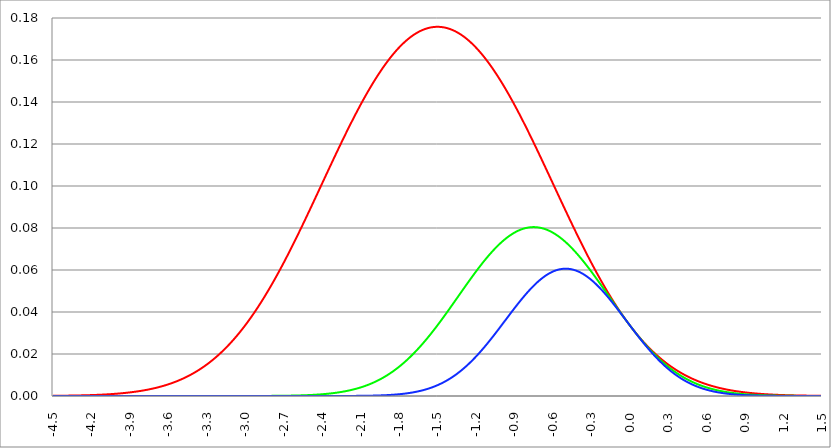
| Category | Series 1 | Series 0 | Series 2 |
|---|---|---|---|
| -4.5 | 0 | 0 | 0 |
| -4.497 | 0 | 0 | 0 |
| -4.494 | 0 | 0 | 0 |
| -4.491 | 0 | 0 | 0 |
| -4.488 | 0 | 0 | 0 |
| -4.484999999999999 | 0 | 0 | 0 |
| -4.482 | 0 | 0 | 0 |
| -4.479 | 0 | 0 | 0 |
| -4.476 | 0 | 0 | 0 |
| -4.472999999999999 | 0 | 0 | 0 |
| -4.469999999999999 | 0 | 0 | 0 |
| -4.466999999999999 | 0 | 0 | 0 |
| -4.463999999999999 | 0 | 0 | 0 |
| -4.460999999999998 | 0 | 0 | 0 |
| -4.457999999999998 | 0 | 0 | 0 |
| -4.454999999999998 | 0 | 0 | 0 |
| -4.451999999999998 | 0 | 0 | 0 |
| -4.448999999999998 | 0 | 0 | 0 |
| -4.445999999999998 | 0 | 0 | 0 |
| -4.442999999999998 | 0 | 0 | 0 |
| -4.439999999999997 | 0 | 0 | 0 |
| -4.436999999999997 | 0 | 0 | 0 |
| -4.433999999999997 | 0 | 0 | 0 |
| -4.430999999999997 | 0 | 0 | 0 |
| -4.427999999999997 | 0 | 0 | 0 |
| -4.424999999999997 | 0 | 0 | 0 |
| -4.421999999999997 | 0 | 0 | 0 |
| -4.418999999999997 | 0 | 0 | 0 |
| -4.415999999999997 | 0 | 0 | 0 |
| -4.412999999999997 | 0 | 0 | 0 |
| -4.409999999999996 | 0 | 0 | 0 |
| -4.406999999999996 | 0 | 0 | 0 |
| -4.403999999999996 | 0 | 0 | 0 |
| -4.400999999999996 | 0 | 0 | 0 |
| -4.397999999999996 | 0 | 0 | 0 |
| -4.394999999999996 | 0 | 0 | 0 |
| -4.391999999999996 | 0 | 0 | 0 |
| -4.388999999999996 | 0 | 0 | 0 |
| -4.385999999999996 | 0 | 0 | 0 |
| -4.382999999999996 | 0 | 0 | 0 |
| -4.379999999999995 | 0 | 0 | 0 |
| -4.376999999999995 | 0 | 0 | 0 |
| -4.373999999999995 | 0 | 0 | 0 |
| -4.370999999999995 | 0 | 0 | 0 |
| -4.367999999999995 | 0 | 0 | 0 |
| -4.364999999999995 | 0 | 0 | 0 |
| -4.361999999999995 | 0 | 0 | 0 |
| -4.358999999999995 | 0 | 0 | 0 |
| -4.355999999999994 | 0 | 0 | 0 |
| -4.352999999999994 | 0 | 0 | 0 |
| -4.349999999999994 | 0 | 0 | 0 |
| -4.346999999999994 | 0 | 0 | 0 |
| -4.343999999999994 | 0 | 0 | 0 |
| -4.340999999999994 | 0 | 0 | 0 |
| -4.337999999999994 | 0 | 0 | 0 |
| -4.334999999999994 | 0 | 0 | 0 |
| -4.331999999999994 | 0 | 0 | 0 |
| -4.328999999999993 | 0 | 0 | 0 |
| -4.325999999999993 | 0 | 0 | 0 |
| -4.322999999999993 | 0 | 0 | 0 |
| -4.319999999999993 | 0 | 0 | 0 |
| -4.316999999999993 | 0 | 0 | 0 |
| -4.313999999999993 | 0 | 0 | 0 |
| -4.310999999999993 | 0 | 0 | 0 |
| -4.307999999999993 | 0 | 0 | 0 |
| -4.304999999999993 | 0 | 0 | 0 |
| -4.301999999999992 | 0 | 0 | 0 |
| -4.298999999999992 | 0 | 0 | 0 |
| -4.295999999999992 | 0 | 0 | 0 |
| -4.292999999999992 | 0 | 0 | 0 |
| -4.289999999999992 | 0 | 0 | 0 |
| -4.286999999999992 | 0 | 0 | 0 |
| -4.283999999999992 | 0 | 0 | 0 |
| -4.280999999999992 | 0 | 0 | 0 |
| -4.277999999999992 | 0 | 0 | 0 |
| -4.274999999999991 | 0 | 0 | 0 |
| -4.271999999999991 | 0 | 0 | 0 |
| -4.268999999999991 | 0 | 0 | 0 |
| -4.265999999999991 | 0 | 0 | 0 |
| -4.262999999999991 | 0 | 0 | 0 |
| -4.259999999999991 | 0 | 0 | 0 |
| -4.256999999999991 | 0 | 0 | 0 |
| -4.253999999999991 | 0 | 0 | 0 |
| -4.250999999999991 | 0 | 0 | 0 |
| -4.24799999999999 | 0 | 0 | 0 |
| -4.24499999999999 | 0 | 0 | 0 |
| -4.24199999999999 | 0 | 0 | 0 |
| -4.23899999999999 | 0 | 0 | 0 |
| -4.23599999999999 | 0 | 0 | 0 |
| -4.23299999999999 | 0 | 0 | 0 |
| -4.22999999999999 | 0 | 0 | 0 |
| -4.22699999999999 | 0 | 0 | 0 |
| -4.22399999999999 | 0 | 0 | 0 |
| -4.220999999999989 | 0 | 0 | 0 |
| -4.217999999999989 | 0 | 0 | 0 |
| -4.214999999999989 | 0 | 0 | 0 |
| -4.21199999999999 | 0 | 0 | 0 |
| -4.208999999999989 | 0 | 0 | 0 |
| -4.205999999999989 | 0 | 0 | 0 |
| -4.202999999999989 | 0 | 0 | 0 |
| -4.199999999999989 | 0 | 0 | 0 |
| -4.196999999999988 | 0 | 0 | 0 |
| -4.193999999999988 | 0 | 0 | 0 |
| -4.190999999999988 | 0 | 0 | 0 |
| -4.187999999999988 | 0 | 0 | 0 |
| -4.184999999999988 | 0 | 0 | 0 |
| -4.181999999999988 | 0 | 0 | 0 |
| -4.178999999999988 | 0 | 0 | 0 |
| -4.175999999999988 | 0 | 0 | 0 |
| -4.172999999999988 | 0 | 0 | 0 |
| -4.169999999999987 | 0.001 | 0 | 0 |
| -4.166999999999987 | 0.001 | 0 | 0 |
| -4.163999999999987 | 0.001 | 0 | 0 |
| -4.160999999999987 | 0.001 | 0 | 0 |
| -4.157999999999987 | 0.001 | 0 | 0 |
| -4.154999999999987 | 0.001 | 0 | 0 |
| -4.151999999999987 | 0.001 | 0 | 0 |
| -4.148999999999987 | 0.001 | 0 | 0 |
| -4.145999999999987 | 0.001 | 0 | 0 |
| -4.142999999999986 | 0.001 | 0 | 0 |
| -4.139999999999986 | 0.001 | 0 | 0 |
| -4.136999999999986 | 0.001 | 0 | 0 |
| -4.133999999999986 | 0.001 | 0 | 0 |
| -4.130999999999986 | 0.001 | 0 | 0 |
| -4.127999999999986 | 0.001 | 0 | 0 |
| -4.124999999999986 | 0.001 | 0 | 0 |
| -4.121999999999986 | 0.001 | 0 | 0 |
| -4.118999999999986 | 0.001 | 0 | 0 |
| -4.115999999999985 | 0.001 | 0 | 0 |
| -4.112999999999985 | 0.001 | 0 | 0 |
| -4.109999999999985 | 0.001 | 0 | 0 |
| -4.106999999999985 | 0.001 | 0 | 0 |
| -4.103999999999985 | 0.001 | 0 | 0 |
| -4.100999999999985 | 0.001 | 0 | 0 |
| -4.097999999999985 | 0.001 | 0 | 0 |
| -4.094999999999985 | 0.001 | 0 | 0 |
| -4.091999999999984 | 0.001 | 0 | 0 |
| -4.088999999999984 | 0.001 | 0 | 0 |
| -4.085999999999984 | 0.001 | 0 | 0 |
| -4.082999999999984 | 0.001 | 0 | 0 |
| -4.079999999999984 | 0.001 | 0 | 0 |
| -4.076999999999984 | 0.001 | 0 | 0 |
| -4.073999999999984 | 0.001 | 0 | 0 |
| -4.070999999999984 | 0.001 | 0 | 0 |
| -4.067999999999984 | 0.001 | 0 | 0 |
| -4.064999999999984 | 0.001 | 0 | 0 |
| -4.061999999999983 | 0.001 | 0 | 0 |
| -4.058999999999983 | 0.001 | 0 | 0 |
| -4.055999999999983 | 0.001 | 0 | 0 |
| -4.052999999999983 | 0.001 | 0 | 0 |
| -4.049999999999983 | 0.001 | 0 | 0 |
| -4.046999999999983 | 0.001 | 0 | 0 |
| -4.043999999999983 | 0.001 | 0 | 0 |
| -4.040999999999983 | 0.001 | 0 | 0 |
| -4.037999999999982 | 0.001 | 0 | 0 |
| -4.034999999999982 | 0.001 | 0 | 0 |
| -4.031999999999982 | 0.001 | 0 | 0 |
| -4.028999999999982 | 0.001 | 0 | 0 |
| -4.025999999999982 | 0.001 | 0 | 0 |
| -4.022999999999982 | 0.001 | 0 | 0 |
| -4.019999999999982 | 0.001 | 0 | 0 |
| -4.016999999999982 | 0.001 | 0 | 0 |
| -4.013999999999982 | 0.001 | 0 | 0 |
| -4.010999999999981 | 0.001 | 0 | 0 |
| -4.007999999999981 | 0.001 | 0 | 0 |
| -4.004999999999981 | 0.001 | 0 | 0 |
| -4.001999999999981 | 0.001 | 0 | 0 |
| -3.998999999999981 | 0.001 | 0 | 0 |
| -3.995999999999981 | 0.001 | 0 | 0 |
| -3.992999999999981 | 0.001 | 0 | 0 |
| -3.989999999999981 | 0.001 | 0 | 0 |
| -3.986999999999981 | 0.001 | 0 | 0 |
| -3.98399999999998 | 0.001 | 0 | 0 |
| -3.98099999999998 | 0.001 | 0 | 0 |
| -3.97799999999998 | 0.001 | 0 | 0 |
| -3.97499999999998 | 0.001 | 0 | 0 |
| -3.97199999999998 | 0.001 | 0 | 0 |
| -3.96899999999998 | 0.001 | 0 | 0 |
| -3.96599999999998 | 0.001 | 0 | 0 |
| -3.96299999999998 | 0.001 | 0 | 0 |
| -3.95999999999998 | 0.001 | 0 | 0 |
| -3.956999999999979 | 0.001 | 0 | 0 |
| -3.953999999999979 | 0.001 | 0 | 0 |
| -3.950999999999979 | 0.001 | 0 | 0 |
| -3.94799999999998 | 0.001 | 0 | 0 |
| -3.944999999999979 | 0.001 | 0 | 0 |
| -3.941999999999979 | 0.001 | 0 | 0 |
| -3.938999999999979 | 0.001 | 0 | 0 |
| -3.935999999999979 | 0.001 | 0 | 0 |
| -3.932999999999978 | 0.001 | 0 | 0 |
| -3.929999999999978 | 0.002 | 0 | 0 |
| -3.926999999999978 | 0.002 | 0 | 0 |
| -3.923999999999978 | 0.002 | 0 | 0 |
| -3.920999999999978 | 0.002 | 0 | 0 |
| -3.917999999999978 | 0.002 | 0 | 0 |
| -3.914999999999978 | 0.002 | 0 | 0 |
| -3.911999999999978 | 0.002 | 0 | 0 |
| -3.908999999999978 | 0.002 | 0 | 0 |
| -3.905999999999977 | 0.002 | 0 | 0 |
| -3.902999999999977 | 0.002 | 0 | 0 |
| -3.899999999999977 | 0.002 | 0 | 0 |
| -3.896999999999977 | 0.002 | 0 | 0 |
| -3.893999999999977 | 0.002 | 0 | 0 |
| -3.890999999999977 | 0.002 | 0 | 0 |
| -3.887999999999977 | 0.002 | 0 | 0 |
| -3.884999999999977 | 0.002 | 0 | 0 |
| -3.881999999999977 | 0.002 | 0 | 0 |
| -3.878999999999976 | 0.002 | 0 | 0 |
| -3.875999999999976 | 0.002 | 0 | 0 |
| -3.872999999999976 | 0.002 | 0 | 0 |
| -3.869999999999976 | 0.002 | 0 | 0 |
| -3.866999999999976 | 0.002 | 0 | 0 |
| -3.863999999999976 | 0.002 | 0 | 0 |
| -3.860999999999976 | 0.002 | 0 | 0 |
| -3.857999999999976 | 0.002 | 0 | 0 |
| -3.854999999999976 | 0.002 | 0 | 0 |
| -3.851999999999975 | 0.002 | 0 | 0 |
| -3.848999999999975 | 0.002 | 0 | 0 |
| -3.845999999999975 | 0.002 | 0 | 0 |
| -3.842999999999975 | 0.002 | 0 | 0 |
| -3.839999999999975 | 0.002 | 0 | 0 |
| -3.836999999999975 | 0.002 | 0 | 0 |
| -3.833999999999975 | 0.002 | 0 | 0 |
| -3.830999999999975 | 0.002 | 0 | 0 |
| -3.827999999999974 | 0.002 | 0 | 0 |
| -3.824999999999974 | 0.002 | 0 | 0 |
| -3.821999999999974 | 0.002 | 0 | 0 |
| -3.818999999999974 | 0.002 | 0 | 0 |
| -3.815999999999974 | 0.002 | 0 | 0 |
| -3.812999999999974 | 0.002 | 0 | 0 |
| -3.809999999999974 | 0.002 | 0 | 0 |
| -3.806999999999974 | 0.003 | 0 | 0 |
| -3.803999999999974 | 0.003 | 0 | 0 |
| -3.800999999999973 | 0.003 | 0 | 0 |
| -3.797999999999973 | 0.003 | 0 | 0 |
| -3.794999999999973 | 0.003 | 0 | 0 |
| -3.791999999999973 | 0.003 | 0 | 0 |
| -3.788999999999973 | 0.003 | 0 | 0 |
| -3.785999999999973 | 0.003 | 0 | 0 |
| -3.782999999999973 | 0.003 | 0 | 0 |
| -3.779999999999973 | 0.003 | 0 | 0 |
| -3.776999999999973 | 0.003 | 0 | 0 |
| -3.773999999999972 | 0.003 | 0 | 0 |
| -3.770999999999972 | 0.003 | 0 | 0 |
| -3.767999999999972 | 0.003 | 0 | 0 |
| -3.764999999999972 | 0.003 | 0 | 0 |
| -3.761999999999972 | 0.003 | 0 | 0 |
| -3.758999999999972 | 0.003 | 0 | 0 |
| -3.755999999999972 | 0.003 | 0 | 0 |
| -3.752999999999972 | 0.003 | 0 | 0 |
| -3.749999999999972 | 0.003 | 0 | 0 |
| -3.746999999999971 | 0.003 | 0 | 0 |
| -3.743999999999971 | 0.003 | 0 | 0 |
| -3.740999999999971 | 0.003 | 0 | 0 |
| -3.737999999999971 | 0.003 | 0 | 0 |
| -3.734999999999971 | 0.003 | 0 | 0 |
| -3.731999999999971 | 0.003 | 0 | 0 |
| -3.728999999999971 | 0.003 | 0 | 0 |
| -3.725999999999971 | 0.003 | 0 | 0 |
| -3.72299999999997 | 0.004 | 0 | 0 |
| -3.71999999999997 | 0.004 | 0 | 0 |
| -3.71699999999997 | 0.004 | 0 | 0 |
| -3.71399999999997 | 0.004 | 0 | 0 |
| -3.71099999999997 | 0.004 | 0 | 0 |
| -3.70799999999997 | 0.004 | 0 | 0 |
| -3.70499999999997 | 0.004 | 0 | 0 |
| -3.70199999999997 | 0.004 | 0 | 0 |
| -3.69899999999997 | 0.004 | 0 | 0 |
| -3.695999999999969 | 0.004 | 0 | 0 |
| -3.692999999999969 | 0.004 | 0 | 0 |
| -3.689999999999969 | 0.004 | 0 | 0 |
| -3.686999999999969 | 0.004 | 0 | 0 |
| -3.683999999999969 | 0.004 | 0 | 0 |
| -3.680999999999969 | 0.004 | 0 | 0 |
| -3.677999999999969 | 0.004 | 0 | 0 |
| -3.674999999999969 | 0.004 | 0 | 0 |
| -3.671999999999969 | 0.004 | 0 | 0 |
| -3.668999999999968 | 0.004 | 0 | 0 |
| -3.665999999999968 | 0.004 | 0 | 0 |
| -3.662999999999968 | 0.004 | 0 | 0 |
| -3.659999999999968 | 0.004 | 0 | 0 |
| -3.656999999999968 | 0.005 | 0 | 0 |
| -3.653999999999968 | 0.005 | 0 | 0 |
| -3.650999999999968 | 0.005 | 0 | 0 |
| -3.647999999999968 | 0.005 | 0 | 0 |
| -3.644999999999968 | 0.005 | 0 | 0 |
| -3.641999999999967 | 0.005 | 0 | 0 |
| -3.638999999999967 | 0.005 | 0 | 0 |
| -3.635999999999967 | 0.005 | 0 | 0 |
| -3.632999999999967 | 0.005 | 0 | 0 |
| -3.629999999999967 | 0.005 | 0 | 0 |
| -3.626999999999967 | 0.005 | 0 | 0 |
| -3.623999999999967 | 0.005 | 0 | 0 |
| -3.620999999999967 | 0.005 | 0 | 0 |
| -3.617999999999966 | 0.005 | 0 | 0 |
| -3.614999999999966 | 0.005 | 0 | 0 |
| -3.611999999999966 | 0.005 | 0 | 0 |
| -3.608999999999966 | 0.005 | 0 | 0 |
| -3.605999999999966 | 0.005 | 0 | 0 |
| -3.602999999999966 | 0.006 | 0 | 0 |
| -3.599999999999966 | 0.006 | 0 | 0 |
| -3.596999999999966 | 0.006 | 0 | 0 |
| -3.593999999999966 | 0.006 | 0 | 0 |
| -3.590999999999966 | 0.006 | 0 | 0 |
| -3.587999999999965 | 0.006 | 0 | 0 |
| -3.584999999999965 | 0.006 | 0 | 0 |
| -3.581999999999965 | 0.006 | 0 | 0 |
| -3.578999999999965 | 0.006 | 0 | 0 |
| -3.575999999999965 | 0.006 | 0 | 0 |
| -3.572999999999965 | 0.006 | 0 | 0 |
| -3.569999999999965 | 0.006 | 0 | 0 |
| -3.566999999999965 | 0.006 | 0 | 0 |
| -3.563999999999965 | 0.006 | 0 | 0 |
| -3.560999999999964 | 0.006 | 0 | 0 |
| -3.557999999999964 | 0.006 | 0 | 0 |
| -3.554999999999964 | 0.007 | 0 | 0 |
| -3.551999999999964 | 0.007 | 0 | 0 |
| -3.548999999999964 | 0.007 | 0 | 0 |
| -3.545999999999964 | 0.007 | 0 | 0 |
| -3.542999999999964 | 0.007 | 0 | 0 |
| -3.539999999999964 | 0.007 | 0 | 0 |
| -3.536999999999963 | 0.007 | 0 | 0 |
| -3.533999999999963 | 0.007 | 0 | 0 |
| -3.530999999999963 | 0.007 | 0 | 0 |
| -3.527999999999963 | 0.007 | 0 | 0 |
| -3.524999999999963 | 0.007 | 0 | 0 |
| -3.521999999999963 | 0.007 | 0 | 0 |
| -3.518999999999963 | 0.007 | 0 | 0 |
| -3.515999999999963 | 0.007 | 0 | 0 |
| -3.512999999999963 | 0.008 | 0 | 0 |
| -3.509999999999962 | 0.008 | 0 | 0 |
| -3.506999999999962 | 0.008 | 0 | 0 |
| -3.503999999999962 | 0.008 | 0 | 0 |
| -3.500999999999962 | 0.008 | 0 | 0 |
| -3.497999999999962 | 0.008 | 0 | 0 |
| -3.494999999999962 | 0.008 | 0 | 0 |
| -3.491999999999962 | 0.008 | 0 | 0 |
| -3.488999999999962 | 0.008 | 0 | 0 |
| -3.485999999999962 | 0.008 | 0 | 0 |
| -3.482999999999961 | 0.008 | 0 | 0 |
| -3.479999999999961 | 0.008 | 0 | 0 |
| -3.476999999999961 | 0.009 | 0 | 0 |
| -3.473999999999961 | 0.009 | 0 | 0 |
| -3.470999999999961 | 0.009 | 0 | 0 |
| -3.467999999999961 | 0.009 | 0 | 0 |
| -3.464999999999961 | 0.009 | 0 | 0 |
| -3.461999999999961 | 0.009 | 0 | 0 |
| -3.458999999999961 | 0.009 | 0 | 0 |
| -3.45599999999996 | 0.009 | 0 | 0 |
| -3.45299999999996 | 0.009 | 0 | 0 |
| -3.44999999999996 | 0.009 | 0 | 0 |
| -3.44699999999996 | 0.009 | 0 | 0 |
| -3.44399999999996 | 0.01 | 0 | 0 |
| -3.44099999999996 | 0.01 | 0 | 0 |
| -3.43799999999996 | 0.01 | 0 | 0 |
| -3.43499999999996 | 0.01 | 0 | 0 |
| -3.431999999999959 | 0.01 | 0 | 0 |
| -3.428999999999959 | 0.01 | 0 | 0 |
| -3.425999999999959 | 0.01 | 0 | 0 |
| -3.422999999999959 | 0.01 | 0 | 0 |
| -3.419999999999959 | 0.01 | 0 | 0 |
| -3.416999999999959 | 0.01 | 0 | 0 |
| -3.413999999999959 | 0.011 | 0 | 0 |
| -3.410999999999959 | 0.011 | 0 | 0 |
| -3.407999999999959 | 0.011 | 0 | 0 |
| -3.404999999999958 | 0.011 | 0 | 0 |
| -3.401999999999958 | 0.011 | 0 | 0 |
| -3.398999999999958 | 0.011 | 0 | 0 |
| -3.395999999999958 | 0.011 | 0 | 0 |
| -3.392999999999958 | 0.011 | 0 | 0 |
| -3.389999999999958 | 0.011 | 0 | 0 |
| -3.386999999999958 | 0.011 | 0 | 0 |
| -3.383999999999958 | 0.012 | 0 | 0 |
| -3.380999999999958 | 0.012 | 0 | 0 |
| -3.377999999999957 | 0.012 | 0 | 0 |
| -3.374999999999957 | 0.012 | 0 | 0 |
| -3.371999999999957 | 0.012 | 0 | 0 |
| -3.368999999999957 | 0.012 | 0 | 0 |
| -3.365999999999957 | 0.012 | 0 | 0 |
| -3.362999999999957 | 0.012 | 0 | 0 |
| -3.359999999999957 | 0.012 | 0 | 0 |
| -3.356999999999957 | 0.013 | 0 | 0 |
| -3.353999999999957 | 0.013 | 0 | 0 |
| -3.350999999999956 | 0.013 | 0 | 0 |
| -3.347999999999956 | 0.013 | 0 | 0 |
| -3.344999999999956 | 0.013 | 0 | 0 |
| -3.341999999999956 | 0.013 | 0 | 0 |
| -3.338999999999956 | 0.013 | 0 | 0 |
| -3.335999999999956 | 0.013 | 0 | 0 |
| -3.332999999999956 | 0.014 | 0 | 0 |
| -3.329999999999956 | 0.014 | 0 | 0 |
| -3.326999999999955 | 0.014 | 0 | 0 |
| -3.323999999999955 | 0.014 | 0 | 0 |
| -3.320999999999955 | 0.014 | 0 | 0 |
| -3.317999999999955 | 0.014 | 0 | 0 |
| -3.314999999999955 | 0.014 | 0 | 0 |
| -3.311999999999955 | 0.014 | 0 | 0 |
| -3.308999999999955 | 0.015 | 0 | 0 |
| -3.305999999999955 | 0.015 | 0 | 0 |
| -3.302999999999955 | 0.015 | 0 | 0 |
| -3.299999999999954 | 0.015 | 0 | 0 |
| -3.296999999999954 | 0.015 | 0 | 0 |
| -3.293999999999954 | 0.015 | 0 | 0 |
| -3.290999999999954 | 0.015 | 0 | 0 |
| -3.287999999999954 | 0.016 | 0 | 0 |
| -3.284999999999954 | 0.016 | 0 | 0 |
| -3.281999999999954 | 0.016 | 0 | 0 |
| -3.278999999999954 | 0.016 | 0 | 0 |
| -3.275999999999954 | 0.016 | 0 | 0 |
| -3.272999999999953 | 0.016 | 0 | 0 |
| -3.269999999999953 | 0.016 | 0 | 0 |
| -3.266999999999953 | 0.017 | 0 | 0 |
| -3.263999999999953 | 0.017 | 0 | 0 |
| -3.260999999999953 | 0.017 | 0 | 0 |
| -3.257999999999953 | 0.017 | 0 | 0 |
| -3.254999999999953 | 0.017 | 0 | 0 |
| -3.251999999999953 | 0.017 | 0 | 0 |
| -3.248999999999952 | 0.017 | 0 | 0 |
| -3.245999999999952 | 0.018 | 0 | 0 |
| -3.242999999999952 | 0.018 | 0 | 0 |
| -3.239999999999952 | 0.018 | 0 | 0 |
| -3.236999999999952 | 0.018 | 0 | 0 |
| -3.233999999999952 | 0.018 | 0 | 0 |
| -3.230999999999952 | 0.018 | 0 | 0 |
| -3.227999999999952 | 0.019 | 0 | 0 |
| -3.224999999999952 | 0.019 | 0 | 0 |
| -3.221999999999952 | 0.019 | 0 | 0 |
| -3.218999999999951 | 0.019 | 0 | 0 |
| -3.215999999999951 | 0.019 | 0 | 0 |
| -3.212999999999951 | 0.019 | 0 | 0 |
| -3.209999999999951 | 0.019 | 0 | 0 |
| -3.206999999999951 | 0.02 | 0 | 0 |
| -3.203999999999951 | 0.02 | 0 | 0 |
| -3.200999999999951 | 0.02 | 0 | 0 |
| -3.197999999999951 | 0.02 | 0 | 0 |
| -3.194999999999951 | 0.02 | 0 | 0 |
| -3.19199999999995 | 0.02 | 0 | 0 |
| -3.18899999999995 | 0.021 | 0 | 0 |
| -3.18599999999995 | 0.021 | 0 | 0 |
| -3.18299999999995 | 0.021 | 0 | 0 |
| -3.17999999999995 | 0.021 | 0 | 0 |
| -3.17699999999995 | 0.021 | 0 | 0 |
| -3.17399999999995 | 0.022 | 0 | 0 |
| -3.17099999999995 | 0.022 | 0 | 0 |
| -3.16799999999995 | 0.022 | 0 | 0 |
| -3.164999999999949 | 0.022 | 0 | 0 |
| -3.161999999999949 | 0.022 | 0 | 0 |
| -3.158999999999949 | 0.022 | 0 | 0 |
| -3.155999999999949 | 0.023 | 0 | 0 |
| -3.152999999999949 | 0.023 | 0 | 0 |
| -3.149999999999949 | 0.023 | 0 | 0 |
| -3.146999999999949 | 0.023 | 0 | 0 |
| -3.143999999999949 | 0.023 | 0 | 0 |
| -3.140999999999948 | 0.024 | 0 | 0 |
| -3.137999999999948 | 0.024 | 0 | 0 |
| -3.134999999999948 | 0.024 | 0 | 0 |
| -3.131999999999948 | 0.024 | 0 | 0 |
| -3.128999999999948 | 0.024 | 0 | 0 |
| -3.125999999999948 | 0.025 | 0 | 0 |
| -3.122999999999948 | 0.025 | 0 | 0 |
| -3.119999999999948 | 0.025 | 0 | 0 |
| -3.116999999999948 | 0.025 | 0 | 0 |
| -3.113999999999947 | 0.025 | 0 | 0 |
| -3.110999999999947 | 0.025 | 0 | 0 |
| -3.107999999999947 | 0.026 | 0 | 0 |
| -3.104999999999947 | 0.026 | 0 | 0 |
| -3.101999999999947 | 0.026 | 0 | 0 |
| -3.098999999999947 | 0.026 | 0 | 0 |
| -3.095999999999947 | 0.027 | 0 | 0 |
| -3.092999999999947 | 0.027 | 0 | 0 |
| -3.089999999999947 | 0.027 | 0 | 0 |
| -3.086999999999946 | 0.027 | 0 | 0 |
| -3.083999999999946 | 0.027 | 0 | 0 |
| -3.080999999999946 | 0.028 | 0 | 0 |
| -3.077999999999946 | 0.028 | 0 | 0 |
| -3.074999999999946 | 0.028 | 0 | 0 |
| -3.071999999999946 | 0.028 | 0 | 0 |
| -3.068999999999946 | 0.028 | 0 | 0 |
| -3.065999999999946 | 0.029 | 0 | 0 |
| -3.062999999999946 | 0.029 | 0 | 0 |
| -3.059999999999945 | 0.029 | 0 | 0 |
| -3.056999999999945 | 0.029 | 0 | 0 |
| -3.053999999999945 | 0.03 | 0 | 0 |
| -3.050999999999945 | 0.03 | 0 | 0 |
| -3.047999999999945 | 0.03 | 0 | 0 |
| -3.044999999999945 | 0.03 | 0 | 0 |
| -3.041999999999945 | 0.03 | 0 | 0 |
| -3.038999999999945 | 0.031 | 0 | 0 |
| -3.035999999999945 | 0.031 | 0 | 0 |
| -3.032999999999944 | 0.031 | 0 | 0 |
| -3.029999999999944 | 0.031 | 0 | 0 |
| -3.026999999999944 | 0.032 | 0 | 0 |
| -3.023999999999944 | 0.032 | 0 | 0 |
| -3.020999999999944 | 0.032 | 0 | 0 |
| -3.017999999999944 | 0.032 | 0 | 0 |
| -3.014999999999944 | 0.032 | 0 | 0 |
| -3.011999999999944 | 0.033 | 0 | 0 |
| -3.008999999999943 | 0.033 | 0 | 0 |
| -3.005999999999943 | 0.033 | 0 | 0 |
| -3.002999999999943 | 0.033 | 0 | 0 |
| -2.999999999999943 | 0.034 | 0 | 0 |
| -2.996999999999943 | 0.034 | 0 | 0 |
| -2.993999999999943 | 0.034 | 0 | 0 |
| -2.990999999999943 | 0.034 | 0 | 0 |
| -2.987999999999943 | 0.035 | 0 | 0 |
| -2.984999999999943 | 0.035 | 0 | 0 |
| -2.981999999999942 | 0.035 | 0 | 0 |
| -2.978999999999942 | 0.035 | 0 | 0 |
| -2.975999999999942 | 0.036 | 0 | 0 |
| -2.972999999999942 | 0.036 | 0 | 0 |
| -2.969999999999942 | 0.036 | 0 | 0 |
| -2.966999999999942 | 0.036 | 0 | 0 |
| -2.963999999999942 | 0.037 | 0 | 0 |
| -2.960999999999942 | 0.037 | 0 | 0 |
| -2.957999999999942 | 0.037 | 0 | 0 |
| -2.954999999999941 | 0.037 | 0 | 0 |
| -2.951999999999941 | 0.038 | 0 | 0 |
| -2.948999999999941 | 0.038 | 0 | 0 |
| -2.945999999999941 | 0.038 | 0 | 0 |
| -2.942999999999941 | 0.039 | 0 | 0 |
| -2.939999999999941 | 0.039 | 0 | 0 |
| -2.936999999999941 | 0.039 | 0 | 0 |
| -2.933999999999941 | 0.039 | 0 | 0 |
| -2.930999999999941 | 0.04 | 0 | 0 |
| -2.92799999999994 | 0.04 | 0 | 0 |
| -2.92499999999994 | 0.04 | 0 | 0 |
| -2.92199999999994 | 0.04 | 0 | 0 |
| -2.91899999999994 | 0.041 | 0 | 0 |
| -2.91599999999994 | 0.041 | 0 | 0 |
| -2.91299999999994 | 0.041 | 0 | 0 |
| -2.90999999999994 | 0.041 | 0 | 0 |
| -2.90699999999994 | 0.042 | 0 | 0 |
| -2.903999999999939 | 0.042 | 0 | 0 |
| -2.900999999999939 | 0.042 | 0 | 0 |
| -2.897999999999939 | 0.043 | 0 | 0 |
| -2.894999999999939 | 0.043 | 0 | 0 |
| -2.891999999999939 | 0.043 | 0 | 0 |
| -2.888999999999939 | 0.043 | 0 | 0 |
| -2.885999999999939 | 0.044 | 0 | 0 |
| -2.882999999999939 | 0.044 | 0 | 0 |
| -2.879999999999939 | 0.044 | 0 | 0 |
| -2.876999999999938 | 0.045 | 0 | 0 |
| -2.873999999999938 | 0.045 | 0 | 0 |
| -2.870999999999938 | 0.045 | 0 | 0 |
| -2.867999999999938 | 0.045 | 0 | 0 |
| -2.864999999999938 | 0.046 | 0 | 0 |
| -2.861999999999938 | 0.046 | 0 | 0 |
| -2.858999999999938 | 0.046 | 0 | 0 |
| -2.855999999999938 | 0.047 | 0 | 0 |
| -2.852999999999938 | 0.047 | 0 | 0 |
| -2.849999999999937 | 0.047 | 0 | 0 |
| -2.846999999999937 | 0.048 | 0 | 0 |
| -2.843999999999937 | 0.048 | 0 | 0 |
| -2.840999999999937 | 0.048 | 0 | 0 |
| -2.837999999999937 | 0.048 | 0 | 0 |
| -2.834999999999937 | 0.049 | 0 | 0 |
| -2.831999999999937 | 0.049 | 0 | 0 |
| -2.828999999999937 | 0.049 | 0 | 0 |
| -2.825999999999937 | 0.05 | 0 | 0 |
| -2.822999999999936 | 0.05 | 0 | 0 |
| -2.819999999999936 | 0.05 | 0 | 0 |
| -2.816999999999936 | 0.051 | 0 | 0 |
| -2.813999999999936 | 0.051 | 0 | 0 |
| -2.810999999999936 | 0.051 | 0 | 0 |
| -2.807999999999936 | 0.052 | 0 | 0 |
| -2.804999999999936 | 0.052 | 0 | 0 |
| -2.801999999999936 | 0.052 | 0 | 0 |
| -2.798999999999935 | 0.052 | 0 | 0 |
| -2.795999999999935 | 0.053 | 0 | 0 |
| -2.792999999999935 | 0.053 | 0 | 0 |
| -2.789999999999935 | 0.053 | 0 | 0 |
| -2.786999999999935 | 0.054 | 0 | 0 |
| -2.783999999999935 | 0.054 | 0 | 0 |
| -2.780999999999935 | 0.054 | 0 | 0 |
| -2.777999999999935 | 0.055 | 0 | 0 |
| -2.774999999999935 | 0.055 | 0 | 0 |
| -2.771999999999934 | 0.055 | 0 | 0 |
| -2.768999999999934 | 0.056 | 0 | 0 |
| -2.765999999999934 | 0.056 | 0 | 0 |
| -2.762999999999934 | 0.056 | 0 | 0 |
| -2.759999999999934 | 0.057 | 0 | 0 |
| -2.756999999999934 | 0.057 | 0 | 0 |
| -2.753999999999934 | 0.057 | 0 | 0 |
| -2.750999999999934 | 0.058 | 0 | 0 |
| -2.747999999999933 | 0.058 | 0 | 0 |
| -2.744999999999933 | 0.058 | 0 | 0 |
| -2.741999999999933 | 0.059 | 0 | 0 |
| -2.738999999999933 | 0.059 | 0 | 0 |
| -2.735999999999933 | 0.059 | 0 | 0 |
| -2.732999999999933 | 0.06 | 0 | 0 |
| -2.729999999999933 | 0.06 | 0 | 0 |
| -2.726999999999933 | 0.06 | 0 | 0 |
| -2.723999999999932 | 0.061 | 0 | 0 |
| -2.720999999999932 | 0.061 | 0 | 0 |
| -2.717999999999932 | 0.061 | 0 | 0 |
| -2.714999999999932 | 0.062 | 0 | 0 |
| -2.711999999999932 | 0.062 | 0 | 0 |
| -2.708999999999932 | 0.062 | 0 | 0 |
| -2.705999999999932 | 0.063 | 0 | 0 |
| -2.702999999999932 | 0.063 | 0 | 0 |
| -2.699999999999932 | 0.063 | 0 | 0 |
| -2.696999999999932 | 0.064 | 0 | 0 |
| -2.693999999999931 | 0.064 | 0 | 0 |
| -2.690999999999931 | 0.065 | 0 | 0 |
| -2.687999999999931 | 0.065 | 0 | 0 |
| -2.684999999999931 | 0.065 | 0 | 0 |
| -2.681999999999931 | 0.066 | 0 | 0 |
| -2.678999999999931 | 0.066 | 0 | 0 |
| -2.675999999999931 | 0.066 | 0 | 0 |
| -2.672999999999931 | 0.067 | 0 | 0 |
| -2.669999999999931 | 0.067 | 0 | 0 |
| -2.66699999999993 | 0.067 | 0 | 0 |
| -2.66399999999993 | 0.068 | 0 | 0 |
| -2.66099999999993 | 0.068 | 0 | 0 |
| -2.65799999999993 | 0.068 | 0 | 0 |
| -2.65499999999993 | 0.069 | 0 | 0 |
| -2.65199999999993 | 0.069 | 0 | 0 |
| -2.64899999999993 | 0.069 | 0 | 0 |
| -2.64599999999993 | 0.07 | 0 | 0 |
| -2.64299999999993 | 0.07 | 0 | 0 |
| -2.639999999999929 | 0.071 | 0 | 0 |
| -2.636999999999929 | 0.071 | 0 | 0 |
| -2.633999999999929 | 0.071 | 0 | 0 |
| -2.630999999999929 | 0.072 | 0 | 0 |
| -2.627999999999929 | 0.072 | 0 | 0 |
| -2.624999999999929 | 0.072 | 0 | 0 |
| -2.621999999999929 | 0.073 | 0 | 0 |
| -2.618999999999929 | 0.073 | 0 | 0 |
| -2.615999999999929 | 0.074 | 0 | 0 |
| -2.612999999999928 | 0.074 | 0 | 0 |
| -2.609999999999928 | 0.074 | 0 | 0 |
| -2.606999999999928 | 0.075 | 0 | 0 |
| -2.603999999999928 | 0.075 | 0 | 0 |
| -2.600999999999928 | 0.075 | 0 | 0 |
| -2.597999999999928 | 0.076 | 0 | 0 |
| -2.594999999999928 | 0.076 | 0 | 0 |
| -2.591999999999928 | 0.076 | 0 | 0 |
| -2.588999999999928 | 0.077 | 0 | 0 |
| -2.585999999999927 | 0.077 | 0 | 0 |
| -2.582999999999927 | 0.078 | 0 | 0 |
| -2.579999999999927 | 0.078 | 0 | 0 |
| -2.576999999999927 | 0.078 | 0 | 0 |
| -2.573999999999927 | 0.079 | 0 | 0 |
| -2.570999999999927 | 0.079 | 0 | 0 |
| -2.567999999999927 | 0.079 | 0 | 0 |
| -2.564999999999927 | 0.08 | 0 | 0 |
| -2.561999999999927 | 0.08 | 0 | 0 |
| -2.558999999999926 | 0.081 | 0 | 0 |
| -2.555999999999926 | 0.081 | 0 | 0 |
| -2.552999999999926 | 0.081 | 0 | 0 |
| -2.549999999999926 | 0.082 | 0 | 0 |
| -2.546999999999926 | 0.082 | 0 | 0 |
| -2.543999999999926 | 0.083 | 0 | 0 |
| -2.540999999999926 | 0.083 | 0 | 0 |
| -2.537999999999926 | 0.083 | 0 | 0 |
| -2.534999999999926 | 0.084 | 0 | 0 |
| -2.531999999999925 | 0.084 | 0 | 0 |
| -2.528999999999925 | 0.084 | 0 | 0 |
| -2.525999999999925 | 0.085 | 0 | 0 |
| -2.522999999999925 | 0.085 | 0 | 0 |
| -2.519999999999925 | 0.086 | 0 | 0 |
| -2.516999999999925 | 0.086 | 0 | 0 |
| -2.513999999999925 | 0.086 | 0 | 0 |
| -2.510999999999925 | 0.087 | 0 | 0 |
| -2.507999999999925 | 0.087 | 0 | 0 |
| -2.504999999999924 | 0.088 | 0 | 0 |
| -2.501999999999924 | 0.088 | 0 | 0 |
| -2.498999999999924 | 0.088 | 0 | 0 |
| -2.495999999999924 | 0.089 | 0 | 0 |
| -2.492999999999924 | 0.089 | 0 | 0 |
| -2.489999999999924 | 0.089 | 0 | 0 |
| -2.486999999999924 | 0.09 | 0 | 0 |
| -2.483999999999924 | 0.09 | 0.001 | 0 |
| -2.480999999999923 | 0.091 | 0.001 | 0 |
| -2.477999999999923 | 0.091 | 0.001 | 0 |
| -2.474999999999923 | 0.091 | 0.001 | 0 |
| -2.471999999999923 | 0.092 | 0.001 | 0 |
| -2.468999999999923 | 0.092 | 0.001 | 0 |
| -2.465999999999923 | 0.093 | 0.001 | 0 |
| -2.462999999999923 | 0.093 | 0.001 | 0 |
| -2.459999999999923 | 0.093 | 0.001 | 0 |
| -2.456999999999923 | 0.094 | 0.001 | 0 |
| -2.453999999999922 | 0.094 | 0.001 | 0 |
| -2.450999999999922 | 0.095 | 0.001 | 0 |
| -2.447999999999922 | 0.095 | 0.001 | 0 |
| -2.444999999999922 | 0.095 | 0.001 | 0 |
| -2.441999999999922 | 0.096 | 0.001 | 0 |
| -2.438999999999922 | 0.096 | 0.001 | 0 |
| -2.435999999999922 | 0.097 | 0.001 | 0 |
| -2.432999999999922 | 0.097 | 0.001 | 0 |
| -2.429999999999922 | 0.097 | 0.001 | 0 |
| -2.426999999999921 | 0.098 | 0.001 | 0 |
| -2.423999999999921 | 0.098 | 0.001 | 0 |
| -2.420999999999921 | 0.098 | 0.001 | 0 |
| -2.417999999999921 | 0.099 | 0.001 | 0 |
| -2.414999999999921 | 0.099 | 0.001 | 0 |
| -2.411999999999921 | 0.1 | 0.001 | 0 |
| -2.408999999999921 | 0.1 | 0.001 | 0 |
| -2.405999999999921 | 0.1 | 0.001 | 0 |
| -2.402999999999921 | 0.101 | 0.001 | 0 |
| -2.39999999999992 | 0.101 | 0.001 | 0 |
| -2.39699999999992 | 0.102 | 0.001 | 0 |
| -2.39399999999992 | 0.102 | 0.001 | 0 |
| -2.39099999999992 | 0.102 | 0.001 | 0 |
| -2.38799999999992 | 0.103 | 0.001 | 0 |
| -2.38499999999992 | 0.103 | 0.001 | 0 |
| -2.38199999999992 | 0.104 | 0.001 | 0 |
| -2.37899999999992 | 0.104 | 0.001 | 0 |
| -2.375999999999919 | 0.104 | 0.001 | 0 |
| -2.372999999999919 | 0.105 | 0.001 | 0 |
| -2.369999999999919 | 0.105 | 0.001 | 0 |
| -2.366999999999919 | 0.106 | 0.001 | 0 |
| -2.363999999999919 | 0.106 | 0.001 | 0 |
| -2.360999999999919 | 0.106 | 0.001 | 0 |
| -2.357999999999919 | 0.107 | 0.001 | 0 |
| -2.354999999999919 | 0.107 | 0.001 | 0 |
| -2.351999999999919 | 0.108 | 0.001 | 0 |
| -2.348999999999918 | 0.108 | 0.001 | 0 |
| -2.345999999999918 | 0.108 | 0.001 | 0 |
| -2.342999999999918 | 0.109 | 0.001 | 0 |
| -2.339999999999918 | 0.109 | 0.001 | 0 |
| -2.336999999999918 | 0.109 | 0.001 | 0 |
| -2.333999999999918 | 0.11 | 0.001 | 0 |
| -2.330999999999918 | 0.11 | 0.001 | 0 |
| -2.327999999999918 | 0.111 | 0.001 | 0 |
| -2.324999999999918 | 0.111 | 0.001 | 0 |
| -2.321999999999917 | 0.111 | 0.001 | 0 |
| -2.318999999999917 | 0.112 | 0.001 | 0 |
| -2.315999999999917 | 0.112 | 0.001 | 0 |
| -2.312999999999917 | 0.113 | 0.001 | 0 |
| -2.309999999999917 | 0.113 | 0.001 | 0 |
| -2.306999999999917 | 0.113 | 0.001 | 0 |
| -2.303999999999917 | 0.114 | 0.001 | 0 |
| -2.300999999999917 | 0.114 | 0.001 | 0 |
| -2.297999999999916 | 0.115 | 0.001 | 0 |
| -2.294999999999916 | 0.115 | 0.002 | 0 |
| -2.291999999999916 | 0.115 | 0.002 | 0 |
| -2.288999999999916 | 0.116 | 0.002 | 0 |
| -2.285999999999916 | 0.116 | 0.002 | 0 |
| -2.282999999999916 | 0.116 | 0.002 | 0 |
| -2.279999999999916 | 0.117 | 0.002 | 0 |
| -2.276999999999916 | 0.117 | 0.002 | 0 |
| -2.273999999999916 | 0.118 | 0.002 | 0 |
| -2.270999999999916 | 0.118 | 0.002 | 0 |
| -2.267999999999915 | 0.118 | 0.002 | 0 |
| -2.264999999999915 | 0.119 | 0.002 | 0 |
| -2.261999999999915 | 0.119 | 0.002 | 0 |
| -2.258999999999915 | 0.12 | 0.002 | 0 |
| -2.255999999999915 | 0.12 | 0.002 | 0 |
| -2.252999999999915 | 0.12 | 0.002 | 0 |
| -2.249999999999915 | 0.121 | 0.002 | 0 |
| -2.246999999999915 | 0.121 | 0.002 | 0 |
| -2.243999999999914 | 0.121 | 0.002 | 0 |
| -2.240999999999914 | 0.122 | 0.002 | 0 |
| -2.237999999999914 | 0.122 | 0.002 | 0 |
| -2.234999999999914 | 0.123 | 0.002 | 0 |
| -2.231999999999914 | 0.123 | 0.002 | 0 |
| -2.228999999999914 | 0.123 | 0.002 | 0 |
| -2.225999999999914 | 0.124 | 0.002 | 0 |
| -2.222999999999914 | 0.124 | 0.002 | 0 |
| -2.219999999999914 | 0.124 | 0.002 | 0 |
| -2.216999999999913 | 0.125 | 0.002 | 0 |
| -2.213999999999913 | 0.125 | 0.002 | 0 |
| -2.210999999999913 | 0.126 | 0.002 | 0 |
| -2.207999999999913 | 0.126 | 0.002 | 0 |
| -2.204999999999913 | 0.126 | 0.002 | 0 |
| -2.201999999999913 | 0.127 | 0.002 | 0 |
| -2.198999999999913 | 0.127 | 0.003 | 0 |
| -2.195999999999913 | 0.127 | 0.003 | 0 |
| -2.192999999999913 | 0.128 | 0.003 | 0 |
| -2.189999999999912 | 0.128 | 0.003 | 0 |
| -2.186999999999912 | 0.128 | 0.003 | 0 |
| -2.183999999999912 | 0.129 | 0.003 | 0 |
| -2.180999999999912 | 0.129 | 0.003 | 0 |
| -2.177999999999912 | 0.13 | 0.003 | 0 |
| -2.174999999999912 | 0.13 | 0.003 | 0 |
| -2.171999999999912 | 0.13 | 0.003 | 0 |
| -2.168999999999912 | 0.131 | 0.003 | 0 |
| -2.165999999999912 | 0.131 | 0.003 | 0 |
| -2.162999999999911 | 0.131 | 0.003 | 0 |
| -2.159999999999911 | 0.132 | 0.003 | 0 |
| -2.156999999999911 | 0.132 | 0.003 | 0 |
| -2.153999999999911 | 0.132 | 0.003 | 0 |
| -2.150999999999911 | 0.133 | 0.003 | 0 |
| -2.147999999999911 | 0.133 | 0.003 | 0 |
| -2.144999999999911 | 0.134 | 0.003 | 0 |
| -2.141999999999911 | 0.134 | 0.003 | 0 |
| -2.138999999999911 | 0.134 | 0.003 | 0 |
| -2.13599999999991 | 0.135 | 0.003 | 0 |
| -2.13299999999991 | 0.135 | 0.003 | 0 |
| -2.12999999999991 | 0.135 | 0.004 | 0 |
| -2.12699999999991 | 0.136 | 0.004 | 0 |
| -2.12399999999991 | 0.136 | 0.004 | 0 |
| -2.12099999999991 | 0.136 | 0.004 | 0 |
| -2.11799999999991 | 0.137 | 0.004 | 0 |
| -2.11499999999991 | 0.137 | 0.004 | 0 |
| -2.111999999999909 | 0.137 | 0.004 | 0 |
| -2.108999999999909 | 0.138 | 0.004 | 0 |
| -2.105999999999909 | 0.138 | 0.004 | 0 |
| -2.102999999999909 | 0.138 | 0.004 | 0 |
| -2.099999999999909 | 0.139 | 0.004 | 0 |
| -2.096999999999909 | 0.139 | 0.004 | 0 |
| -2.093999999999909 | 0.139 | 0.004 | 0 |
| -2.090999999999909 | 0.14 | 0.004 | 0 |
| -2.087999999999909 | 0.14 | 0.004 | 0 |
| -2.084999999999908 | 0.14 | 0.004 | 0 |
| -2.081999999999908 | 0.141 | 0.004 | 0 |
| -2.078999999999908 | 0.141 | 0.004 | 0 |
| -2.075999999999908 | 0.141 | 0.005 | 0 |
| -2.072999999999908 | 0.142 | 0.005 | 0 |
| -2.069999999999908 | 0.142 | 0.005 | 0 |
| -2.066999999999908 | 0.142 | 0.005 | 0 |
| -2.063999999999908 | 0.143 | 0.005 | 0 |
| -2.060999999999908 | 0.143 | 0.005 | 0 |
| -2.057999999999907 | 0.143 | 0.005 | 0 |
| -2.054999999999907 | 0.144 | 0.005 | 0 |
| -2.051999999999907 | 0.144 | 0.005 | 0 |
| -2.048999999999907 | 0.144 | 0.005 | 0 |
| -2.045999999999907 | 0.145 | 0.005 | 0 |
| -2.042999999999907 | 0.145 | 0.005 | 0 |
| -2.039999999999907 | 0.145 | 0.005 | 0 |
| -2.036999999999907 | 0.146 | 0.005 | 0 |
| -2.033999999999907 | 0.146 | 0.006 | 0 |
| -2.030999999999906 | 0.146 | 0.006 | 0 |
| -2.027999999999906 | 0.147 | 0.006 | 0 |
| -2.024999999999906 | 0.147 | 0.006 | 0 |
| -2.021999999999906 | 0.147 | 0.006 | 0 |
| -2.018999999999906 | 0.147 | 0.006 | 0 |
| -2.015999999999906 | 0.148 | 0.006 | 0 |
| -2.012999999999906 | 0.148 | 0.006 | 0 |
| -2.009999999999906 | 0.148 | 0.006 | 0 |
| -2.006999999999906 | 0.149 | 0.006 | 0 |
| -2.003999999999905 | 0.149 | 0.006 | 0 |
| -2.000999999999905 | 0.149 | 0.006 | 0 |
| -1.997999999999905 | 0.15 | 0.006 | 0 |
| -1.994999999999905 | 0.15 | 0.007 | 0 |
| -1.991999999999906 | 0.15 | 0.007 | 0 |
| -1.988999999999906 | 0.15 | 0.007 | 0 |
| -1.985999999999906 | 0.151 | 0.007 | 0 |
| -1.982999999999906 | 0.151 | 0.007 | 0 |
| -1.979999999999906 | 0.151 | 0.007 | 0 |
| -1.976999999999906 | 0.152 | 0.007 | 0 |
| -1.973999999999906 | 0.152 | 0.007 | 0 |
| -1.970999999999906 | 0.152 | 0.007 | 0 |
| -1.967999999999906 | 0.152 | 0.007 | 0 |
| -1.964999999999907 | 0.153 | 0.007 | 0 |
| -1.961999999999907 | 0.153 | 0.007 | 0 |
| -1.958999999999907 | 0.153 | 0.008 | 0 |
| -1.955999999999907 | 0.154 | 0.008 | 0 |
| -1.952999999999907 | 0.154 | 0.008 | 0 |
| -1.949999999999907 | 0.154 | 0.008 | 0 |
| -1.946999999999907 | 0.154 | 0.008 | 0 |
| -1.943999999999907 | 0.155 | 0.008 | 0 |
| -1.940999999999907 | 0.155 | 0.008 | 0 |
| -1.937999999999908 | 0.155 | 0.008 | 0 |
| -1.934999999999908 | 0.156 | 0.008 | 0 |
| -1.931999999999908 | 0.156 | 0.008 | 0 |
| -1.928999999999908 | 0.156 | 0.009 | 0 |
| -1.925999999999908 | 0.156 | 0.009 | 0 |
| -1.922999999999908 | 0.157 | 0.009 | 0 |
| -1.919999999999908 | 0.157 | 0.009 | 0 |
| -1.916999999999908 | 0.157 | 0.009 | 0 |
| -1.913999999999908 | 0.157 | 0.009 | 0 |
| -1.910999999999909 | 0.158 | 0.009 | 0 |
| -1.907999999999909 | 0.158 | 0.009 | 0 |
| -1.904999999999909 | 0.158 | 0.009 | 0 |
| -1.901999999999909 | 0.158 | 0.01 | 0 |
| -1.898999999999909 | 0.159 | 0.01 | 0 |
| -1.895999999999909 | 0.159 | 0.01 | 0 |
| -1.892999999999909 | 0.159 | 0.01 | 0 |
| -1.889999999999909 | 0.159 | 0.01 | 0 |
| -1.886999999999909 | 0.16 | 0.01 | 0 |
| -1.883999999999909 | 0.16 | 0.01 | 0 |
| -1.88099999999991 | 0.16 | 0.01 | 0 |
| -1.87799999999991 | 0.16 | 0.01 | 0 |
| -1.87499999999991 | 0.161 | 0.011 | 0 |
| -1.87199999999991 | 0.161 | 0.011 | 0 |
| -1.86899999999991 | 0.161 | 0.011 | 0.001 |
| -1.86599999999991 | 0.161 | 0.011 | 0.001 |
| -1.86299999999991 | 0.161 | 0.011 | 0.001 |
| -1.85999999999991 | 0.162 | 0.011 | 0.001 |
| -1.85699999999991 | 0.162 | 0.011 | 0.001 |
| -1.853999999999911 | 0.162 | 0.011 | 0.001 |
| -1.850999999999911 | 0.162 | 0.012 | 0.001 |
| -1.847999999999911 | 0.163 | 0.012 | 0.001 |
| -1.844999999999911 | 0.163 | 0.012 | 0.001 |
| -1.841999999999911 | 0.163 | 0.012 | 0.001 |
| -1.838999999999911 | 0.163 | 0.012 | 0.001 |
| -1.835999999999911 | 0.163 | 0.012 | 0.001 |
| -1.832999999999911 | 0.164 | 0.012 | 0.001 |
| -1.829999999999911 | 0.164 | 0.013 | 0.001 |
| -1.826999999999912 | 0.164 | 0.013 | 0.001 |
| -1.823999999999912 | 0.164 | 0.013 | 0.001 |
| -1.820999999999912 | 0.165 | 0.013 | 0.001 |
| -1.817999999999912 | 0.165 | 0.013 | 0.001 |
| -1.814999999999912 | 0.165 | 0.013 | 0.001 |
| -1.811999999999912 | 0.165 | 0.013 | 0.001 |
| -1.808999999999912 | 0.165 | 0.013 | 0.001 |
| -1.805999999999912 | 0.166 | 0.014 | 0.001 |
| -1.802999999999912 | 0.166 | 0.014 | 0.001 |
| -1.799999999999912 | 0.166 | 0.014 | 0.001 |
| -1.796999999999913 | 0.166 | 0.014 | 0.001 |
| -1.793999999999913 | 0.166 | 0.014 | 0.001 |
| -1.790999999999913 | 0.167 | 0.014 | 0.001 |
| -1.787999999999913 | 0.167 | 0.015 | 0.001 |
| -1.784999999999913 | 0.167 | 0.015 | 0.001 |
| -1.781999999999913 | 0.167 | 0.015 | 0.001 |
| -1.778999999999913 | 0.167 | 0.015 | 0.001 |
| -1.775999999999913 | 0.167 | 0.015 | 0.001 |
| -1.772999999999913 | 0.168 | 0.015 | 0.001 |
| -1.769999999999914 | 0.168 | 0.015 | 0.001 |
| -1.766999999999914 | 0.168 | 0.016 | 0.001 |
| -1.763999999999914 | 0.168 | 0.016 | 0.001 |
| -1.760999999999914 | 0.168 | 0.016 | 0.001 |
| -1.757999999999914 | 0.168 | 0.016 | 0.001 |
| -1.754999999999914 | 0.169 | 0.016 | 0.001 |
| -1.751999999999914 | 0.169 | 0.016 | 0.001 |
| -1.748999999999914 | 0.169 | 0.017 | 0.001 |
| -1.745999999999914 | 0.169 | 0.017 | 0.001 |
| -1.742999999999915 | 0.169 | 0.017 | 0.001 |
| -1.739999999999915 | 0.169 | 0.017 | 0.001 |
| -1.736999999999915 | 0.17 | 0.017 | 0.001 |
| -1.733999999999915 | 0.17 | 0.017 | 0.001 |
| -1.730999999999915 | 0.17 | 0.018 | 0.001 |
| -1.727999999999915 | 0.17 | 0.018 | 0.001 |
| -1.724999999999915 | 0.17 | 0.018 | 0.001 |
| -1.721999999999915 | 0.17 | 0.018 | 0.001 |
| -1.718999999999915 | 0.17 | 0.018 | 0.001 |
| -1.715999999999916 | 0.171 | 0.018 | 0.001 |
| -1.712999999999916 | 0.171 | 0.019 | 0.001 |
| -1.709999999999916 | 0.171 | 0.019 | 0.002 |
| -1.706999999999916 | 0.171 | 0.019 | 0.002 |
| -1.703999999999916 | 0.171 | 0.019 | 0.002 |
| -1.700999999999916 | 0.171 | 0.019 | 0.002 |
| -1.697999999999916 | 0.171 | 0.02 | 0.002 |
| -1.694999999999916 | 0.172 | 0.02 | 0.002 |
| -1.691999999999916 | 0.172 | 0.02 | 0.002 |
| -1.688999999999916 | 0.172 | 0.02 | 0.002 |
| -1.685999999999917 | 0.172 | 0.02 | 0.002 |
| -1.682999999999917 | 0.172 | 0.02 | 0.002 |
| -1.679999999999917 | 0.172 | 0.021 | 0.002 |
| -1.676999999999917 | 0.172 | 0.021 | 0.002 |
| -1.673999999999917 | 0.172 | 0.021 | 0.002 |
| -1.670999999999917 | 0.173 | 0.021 | 0.002 |
| -1.667999999999917 | 0.173 | 0.021 | 0.002 |
| -1.664999999999917 | 0.173 | 0.022 | 0.002 |
| -1.661999999999917 | 0.173 | 0.022 | 0.002 |
| -1.658999999999918 | 0.173 | 0.022 | 0.002 |
| -1.655999999999918 | 0.173 | 0.022 | 0.002 |
| -1.652999999999918 | 0.173 | 0.022 | 0.002 |
| -1.649999999999918 | 0.173 | 0.023 | 0.002 |
| -1.646999999999918 | 0.173 | 0.023 | 0.002 |
| -1.643999999999918 | 0.173 | 0.023 | 0.002 |
| -1.640999999999918 | 0.174 | 0.023 | 0.002 |
| -1.637999999999918 | 0.174 | 0.023 | 0.002 |
| -1.634999999999918 | 0.174 | 0.024 | 0.002 |
| -1.631999999999919 | 0.174 | 0.024 | 0.002 |
| -1.628999999999919 | 0.174 | 0.024 | 0.003 |
| -1.625999999999919 | 0.174 | 0.024 | 0.003 |
| -1.622999999999919 | 0.174 | 0.024 | 0.003 |
| -1.619999999999919 | 0.174 | 0.025 | 0.003 |
| -1.616999999999919 | 0.174 | 0.025 | 0.003 |
| -1.613999999999919 | 0.174 | 0.025 | 0.003 |
| -1.610999999999919 | 0.174 | 0.025 | 0.003 |
| -1.607999999999919 | 0.174 | 0.025 | 0.003 |
| -1.60499999999992 | 0.175 | 0.026 | 0.003 |
| -1.60199999999992 | 0.175 | 0.026 | 0.003 |
| -1.59899999999992 | 0.175 | 0.026 | 0.003 |
| -1.59599999999992 | 0.175 | 0.026 | 0.003 |
| -1.59299999999992 | 0.175 | 0.027 | 0.003 |
| -1.58999999999992 | 0.175 | 0.027 | 0.003 |
| -1.58699999999992 | 0.175 | 0.027 | 0.003 |
| -1.58399999999992 | 0.175 | 0.027 | 0.003 |
| -1.58099999999992 | 0.175 | 0.027 | 0.003 |
| -1.577999999999921 | 0.175 | 0.028 | 0.003 |
| -1.574999999999921 | 0.175 | 0.028 | 0.003 |
| -1.571999999999921 | 0.175 | 0.028 | 0.003 |
| -1.568999999999921 | 0.175 | 0.028 | 0.004 |
| -1.565999999999921 | 0.175 | 0.029 | 0.004 |
| -1.562999999999921 | 0.175 | 0.029 | 0.004 |
| -1.559999999999921 | 0.175 | 0.029 | 0.004 |
| -1.556999999999921 | 0.175 | 0.029 | 0.004 |
| -1.553999999999921 | 0.175 | 0.029 | 0.004 |
| -1.550999999999922 | 0.176 | 0.03 | 0.004 |
| -1.547999999999922 | 0.176 | 0.03 | 0.004 |
| -1.544999999999922 | 0.176 | 0.03 | 0.004 |
| -1.541999999999922 | 0.176 | 0.03 | 0.004 |
| -1.538999999999922 | 0.176 | 0.031 | 0.004 |
| -1.535999999999922 | 0.176 | 0.031 | 0.004 |
| -1.532999999999922 | 0.176 | 0.031 | 0.004 |
| -1.529999999999922 | 0.176 | 0.031 | 0.004 |
| -1.526999999999922 | 0.176 | 0.032 | 0.004 |
| -1.523999999999923 | 0.176 | 0.032 | 0.005 |
| -1.520999999999923 | 0.176 | 0.032 | 0.005 |
| -1.517999999999923 | 0.176 | 0.032 | 0.005 |
| -1.514999999999923 | 0.176 | 0.032 | 0.005 |
| -1.511999999999923 | 0.176 | 0.033 | 0.005 |
| -1.508999999999923 | 0.176 | 0.033 | 0.005 |
| -1.505999999999923 | 0.176 | 0.033 | 0.005 |
| -1.502999999999923 | 0.176 | 0.033 | 0.005 |
| -1.499999999999923 | 0.176 | 0.034 | 0.005 |
| -1.496999999999923 | 0.176 | 0.034 | 0.005 |
| -1.493999999999924 | 0.176 | 0.034 | 0.005 |
| -1.490999999999924 | 0.176 | 0.034 | 0.005 |
| -1.487999999999924 | 0.176 | 0.035 | 0.005 |
| -1.484999999999924 | 0.176 | 0.035 | 0.006 |
| -1.481999999999924 | 0.176 | 0.035 | 0.006 |
| -1.478999999999924 | 0.176 | 0.035 | 0.006 |
| -1.475999999999924 | 0.176 | 0.036 | 0.006 |
| -1.472999999999924 | 0.176 | 0.036 | 0.006 |
| -1.469999999999924 | 0.176 | 0.036 | 0.006 |
| -1.466999999999925 | 0.176 | 0.036 | 0.006 |
| -1.463999999999925 | 0.176 | 0.037 | 0.006 |
| -1.460999999999925 | 0.176 | 0.037 | 0.006 |
| -1.457999999999925 | 0.176 | 0.037 | 0.006 |
| -1.454999999999925 | 0.176 | 0.037 | 0.006 |
| -1.451999999999925 | 0.176 | 0.038 | 0.007 |
| -1.448999999999925 | 0.176 | 0.038 | 0.007 |
| -1.445999999999925 | 0.175 | 0.038 | 0.007 |
| -1.442999999999925 | 0.175 | 0.038 | 0.007 |
| -1.439999999999926 | 0.175 | 0.039 | 0.007 |
| -1.436999999999926 | 0.175 | 0.039 | 0.007 |
| -1.433999999999926 | 0.175 | 0.039 | 0.007 |
| -1.430999999999926 | 0.175 | 0.039 | 0.007 |
| -1.427999999999926 | 0.175 | 0.04 | 0.007 |
| -1.424999999999926 | 0.175 | 0.04 | 0.007 |
| -1.421999999999926 | 0.175 | 0.04 | 0.008 |
| -1.418999999999926 | 0.175 | 0.04 | 0.008 |
| -1.415999999999926 | 0.175 | 0.041 | 0.008 |
| -1.412999999999927 | 0.175 | 0.041 | 0.008 |
| -1.409999999999927 | 0.175 | 0.041 | 0.008 |
| -1.406999999999927 | 0.175 | 0.041 | 0.008 |
| -1.403999999999927 | 0.175 | 0.042 | 0.008 |
| -1.400999999999927 | 0.175 | 0.042 | 0.008 |
| -1.397999999999927 | 0.175 | 0.042 | 0.008 |
| -1.394999999999927 | 0.175 | 0.043 | 0.009 |
| -1.391999999999927 | 0.174 | 0.043 | 0.009 |
| -1.388999999999927 | 0.174 | 0.043 | 0.009 |
| -1.385999999999927 | 0.174 | 0.043 | 0.009 |
| -1.382999999999928 | 0.174 | 0.044 | 0.009 |
| -1.379999999999928 | 0.174 | 0.044 | 0.009 |
| -1.376999999999928 | 0.174 | 0.044 | 0.009 |
| -1.373999999999928 | 0.174 | 0.044 | 0.009 |
| -1.370999999999928 | 0.174 | 0.045 | 0.01 |
| -1.367999999999928 | 0.174 | 0.045 | 0.01 |
| -1.364999999999928 | 0.174 | 0.045 | 0.01 |
| -1.361999999999928 | 0.174 | 0.045 | 0.01 |
| -1.358999999999928 | 0.174 | 0.046 | 0.01 |
| -1.355999999999929 | 0.173 | 0.046 | 0.01 |
| -1.352999999999929 | 0.173 | 0.046 | 0.01 |
| -1.349999999999929 | 0.173 | 0.046 | 0.01 |
| -1.346999999999929 | 0.173 | 0.047 | 0.011 |
| -1.343999999999929 | 0.173 | 0.047 | 0.011 |
| -1.340999999999929 | 0.173 | 0.047 | 0.011 |
| -1.337999999999929 | 0.173 | 0.047 | 0.011 |
| -1.334999999999929 | 0.173 | 0.048 | 0.011 |
| -1.331999999999929 | 0.173 | 0.048 | 0.011 |
| -1.32899999999993 | 0.173 | 0.048 | 0.011 |
| -1.32599999999993 | 0.172 | 0.049 | 0.012 |
| -1.32299999999993 | 0.172 | 0.049 | 0.012 |
| -1.31999999999993 | 0.172 | 0.049 | 0.012 |
| -1.31699999999993 | 0.172 | 0.049 | 0.012 |
| -1.31399999999993 | 0.172 | 0.05 | 0.012 |
| -1.31099999999993 | 0.172 | 0.05 | 0.012 |
| -1.30799999999993 | 0.172 | 0.05 | 0.012 |
| -1.30499999999993 | 0.172 | 0.05 | 0.013 |
| -1.301999999999931 | 0.171 | 0.051 | 0.013 |
| -1.298999999999931 | 0.171 | 0.051 | 0.013 |
| -1.295999999999931 | 0.171 | 0.051 | 0.013 |
| -1.292999999999931 | 0.171 | 0.051 | 0.013 |
| -1.289999999999931 | 0.171 | 0.052 | 0.013 |
| -1.286999999999931 | 0.171 | 0.052 | 0.014 |
| -1.283999999999931 | 0.171 | 0.052 | 0.014 |
| -1.280999999999931 | 0.17 | 0.052 | 0.014 |
| -1.277999999999931 | 0.17 | 0.053 | 0.014 |
| -1.274999999999932 | 0.17 | 0.053 | 0.014 |
| -1.271999999999932 | 0.17 | 0.053 | 0.014 |
| -1.268999999999932 | 0.17 | 0.053 | 0.015 |
| -1.265999999999932 | 0.17 | 0.054 | 0.015 |
| -1.262999999999932 | 0.17 | 0.054 | 0.015 |
| -1.259999999999932 | 0.169 | 0.054 | 0.015 |
| -1.256999999999932 | 0.169 | 0.054 | 0.015 |
| -1.253999999999932 | 0.169 | 0.055 | 0.015 |
| -1.250999999999932 | 0.169 | 0.055 | 0.016 |
| -1.247999999999932 | 0.169 | 0.055 | 0.016 |
| -1.244999999999933 | 0.169 | 0.055 | 0.016 |
| -1.241999999999933 | 0.168 | 0.056 | 0.016 |
| -1.238999999999933 | 0.168 | 0.056 | 0.016 |
| -1.235999999999933 | 0.168 | 0.056 | 0.017 |
| -1.232999999999933 | 0.168 | 0.057 | 0.017 |
| -1.229999999999933 | 0.168 | 0.057 | 0.017 |
| -1.226999999999933 | 0.168 | 0.057 | 0.017 |
| -1.223999999999933 | 0.167 | 0.057 | 0.017 |
| -1.220999999999933 | 0.167 | 0.058 | 0.017 |
| -1.217999999999934 | 0.167 | 0.058 | 0.018 |
| -1.214999999999934 | 0.167 | 0.058 | 0.018 |
| -1.211999999999934 | 0.167 | 0.058 | 0.018 |
| -1.208999999999934 | 0.167 | 0.059 | 0.018 |
| -1.205999999999934 | 0.166 | 0.059 | 0.018 |
| -1.202999999999934 | 0.166 | 0.059 | 0.019 |
| -1.199999999999934 | 0.166 | 0.059 | 0.019 |
| -1.196999999999934 | 0.166 | 0.059 | 0.019 |
| -1.193999999999934 | 0.166 | 0.06 | 0.019 |
| -1.190999999999935 | 0.165 | 0.06 | 0.019 |
| -1.187999999999935 | 0.165 | 0.06 | 0.02 |
| -1.184999999999935 | 0.165 | 0.06 | 0.02 |
| -1.181999999999935 | 0.165 | 0.061 | 0.02 |
| -1.178999999999935 | 0.165 | 0.061 | 0.02 |
| -1.175999999999935 | 0.164 | 0.061 | 0.02 |
| -1.172999999999935 | 0.164 | 0.061 | 0.021 |
| -1.169999999999935 | 0.164 | 0.062 | 0.021 |
| -1.166999999999935 | 0.164 | 0.062 | 0.021 |
| -1.163999999999936 | 0.163 | 0.062 | 0.021 |
| -1.160999999999936 | 0.163 | 0.062 | 0.021 |
| -1.157999999999936 | 0.163 | 0.063 | 0.022 |
| -1.154999999999936 | 0.163 | 0.063 | 0.022 |
| -1.151999999999936 | 0.163 | 0.063 | 0.022 |
| -1.148999999999936 | 0.162 | 0.063 | 0.022 |
| -1.145999999999936 | 0.162 | 0.064 | 0.022 |
| -1.142999999999936 | 0.162 | 0.064 | 0.023 |
| -1.139999999999936 | 0.162 | 0.064 | 0.023 |
| -1.136999999999936 | 0.161 | 0.064 | 0.023 |
| -1.133999999999937 | 0.161 | 0.064 | 0.023 |
| -1.130999999999937 | 0.161 | 0.065 | 0.024 |
| -1.127999999999937 | 0.161 | 0.065 | 0.024 |
| -1.124999999999937 | 0.161 | 0.065 | 0.024 |
| -1.121999999999937 | 0.16 | 0.065 | 0.024 |
| -1.118999999999937 | 0.16 | 0.066 | 0.024 |
| -1.115999999999937 | 0.16 | 0.066 | 0.025 |
| -1.112999999999937 | 0.16 | 0.066 | 0.025 |
| -1.109999999999937 | 0.159 | 0.066 | 0.025 |
| -1.106999999999938 | 0.159 | 0.066 | 0.025 |
| -1.103999999999938 | 0.159 | 0.067 | 0.026 |
| -1.100999999999938 | 0.159 | 0.067 | 0.026 |
| -1.097999999999938 | 0.158 | 0.067 | 0.026 |
| -1.094999999999938 | 0.158 | 0.067 | 0.026 |
| -1.091999999999938 | 0.158 | 0.067 | 0.026 |
| -1.088999999999938 | 0.158 | 0.068 | 0.027 |
| -1.085999999999938 | 0.157 | 0.068 | 0.027 |
| -1.082999999999938 | 0.157 | 0.068 | 0.027 |
| -1.079999999999939 | 0.157 | 0.068 | 0.027 |
| -1.076999999999939 | 0.157 | 0.069 | 0.028 |
| -1.073999999999939 | 0.156 | 0.069 | 0.028 |
| -1.070999999999939 | 0.156 | 0.069 | 0.028 |
| -1.067999999999939 | 0.156 | 0.069 | 0.028 |
| -1.064999999999939 | 0.156 | 0.069 | 0.029 |
| -1.061999999999939 | 0.155 | 0.07 | 0.029 |
| -1.058999999999939 | 0.155 | 0.07 | 0.029 |
| -1.055999999999939 | 0.155 | 0.07 | 0.029 |
| -1.05299999999994 | 0.154 | 0.07 | 0.029 |
| -1.04999999999994 | 0.154 | 0.07 | 0.03 |
| -1.04699999999994 | 0.154 | 0.07 | 0.03 |
| -1.04399999999994 | 0.154 | 0.071 | 0.03 |
| -1.04099999999994 | 0.153 | 0.071 | 0.03 |
| -1.03799999999994 | 0.153 | 0.071 | 0.031 |
| -1.03499999999994 | 0.153 | 0.071 | 0.031 |
| -1.03199999999994 | 0.152 | 0.071 | 0.031 |
| -1.02899999999994 | 0.152 | 0.072 | 0.031 |
| -1.025999999999941 | 0.152 | 0.072 | 0.032 |
| -1.022999999999941 | 0.152 | 0.072 | 0.032 |
| -1.019999999999941 | 0.151 | 0.072 | 0.032 |
| -1.016999999999941 | 0.151 | 0.072 | 0.032 |
| -1.013999999999941 | 0.151 | 0.072 | 0.033 |
| -1.010999999999941 | 0.15 | 0.073 | 0.033 |
| -1.007999999999941 | 0.15 | 0.073 | 0.033 |
| -1.004999999999941 | 0.15 | 0.073 | 0.033 |
| -1.001999999999941 | 0.15 | 0.073 | 0.034 |
| -0.998999999999941 | 0.149 | 0.073 | 0.034 |
| -0.995999999999941 | 0.149 | 0.073 | 0.034 |
| -0.992999999999941 | 0.149 | 0.074 | 0.034 |
| -0.989999999999941 | 0.148 | 0.074 | 0.034 |
| -0.986999999999941 | 0.148 | 0.074 | 0.035 |
| -0.983999999999941 | 0.148 | 0.074 | 0.035 |
| -0.980999999999941 | 0.147 | 0.074 | 0.035 |
| -0.977999999999941 | 0.147 | 0.074 | 0.035 |
| -0.974999999999941 | 0.147 | 0.075 | 0.036 |
| -0.971999999999941 | 0.147 | 0.075 | 0.036 |
| -0.968999999999941 | 0.146 | 0.075 | 0.036 |
| -0.965999999999941 | 0.146 | 0.075 | 0.036 |
| -0.962999999999941 | 0.146 | 0.075 | 0.037 |
| -0.959999999999941 | 0.145 | 0.075 | 0.037 |
| -0.956999999999941 | 0.145 | 0.075 | 0.037 |
| -0.953999999999941 | 0.145 | 0.076 | 0.037 |
| -0.950999999999941 | 0.144 | 0.076 | 0.038 |
| -0.947999999999941 | 0.144 | 0.076 | 0.038 |
| -0.944999999999941 | 0.144 | 0.076 | 0.038 |
| -0.941999999999941 | 0.143 | 0.076 | 0.038 |
| -0.938999999999941 | 0.143 | 0.076 | 0.039 |
| -0.935999999999941 | 0.143 | 0.076 | 0.039 |
| -0.932999999999941 | 0.142 | 0.077 | 0.039 |
| -0.929999999999941 | 0.142 | 0.077 | 0.039 |
| -0.926999999999941 | 0.142 | 0.077 | 0.04 |
| -0.923999999999941 | 0.141 | 0.077 | 0.04 |
| -0.920999999999941 | 0.141 | 0.077 | 0.04 |
| -0.917999999999941 | 0.141 | 0.077 | 0.04 |
| -0.914999999999941 | 0.14 | 0.077 | 0.041 |
| -0.911999999999941 | 0.14 | 0.077 | 0.041 |
| -0.908999999999941 | 0.14 | 0.077 | 0.041 |
| -0.905999999999941 | 0.139 | 0.078 | 0.041 |
| -0.902999999999941 | 0.139 | 0.078 | 0.042 |
| -0.899999999999941 | 0.139 | 0.078 | 0.042 |
| -0.896999999999941 | 0.138 | 0.078 | 0.042 |
| -0.893999999999941 | 0.138 | 0.078 | 0.042 |
| -0.890999999999941 | 0.138 | 0.078 | 0.042 |
| -0.887999999999941 | 0.137 | 0.078 | 0.043 |
| -0.884999999999941 | 0.137 | 0.078 | 0.043 |
| -0.881999999999941 | 0.137 | 0.078 | 0.043 |
| -0.878999999999941 | 0.136 | 0.078 | 0.043 |
| -0.875999999999941 | 0.136 | 0.079 | 0.044 |
| -0.872999999999941 | 0.136 | 0.079 | 0.044 |
| -0.869999999999941 | 0.135 | 0.079 | 0.044 |
| -0.866999999999941 | 0.135 | 0.079 | 0.044 |
| -0.863999999999941 | 0.135 | 0.079 | 0.045 |
| -0.860999999999941 | 0.134 | 0.079 | 0.045 |
| -0.857999999999941 | 0.134 | 0.079 | 0.045 |
| -0.854999999999941 | 0.134 | 0.079 | 0.045 |
| -0.851999999999941 | 0.133 | 0.079 | 0.045 |
| -0.848999999999941 | 0.133 | 0.079 | 0.046 |
| -0.845999999999941 | 0.132 | 0.079 | 0.046 |
| -0.842999999999941 | 0.132 | 0.079 | 0.046 |
| -0.839999999999941 | 0.132 | 0.079 | 0.046 |
| -0.836999999999941 | 0.131 | 0.08 | 0.047 |
| -0.833999999999941 | 0.131 | 0.08 | 0.047 |
| -0.830999999999941 | 0.131 | 0.08 | 0.047 |
| -0.827999999999941 | 0.13 | 0.08 | 0.047 |
| -0.824999999999941 | 0.13 | 0.08 | 0.047 |
| -0.821999999999941 | 0.13 | 0.08 | 0.048 |
| -0.818999999999941 | 0.129 | 0.08 | 0.048 |
| -0.815999999999941 | 0.129 | 0.08 | 0.048 |
| -0.812999999999941 | 0.128 | 0.08 | 0.048 |
| -0.809999999999941 | 0.128 | 0.08 | 0.049 |
| -0.806999999999941 | 0.128 | 0.08 | 0.049 |
| -0.803999999999941 | 0.127 | 0.08 | 0.049 |
| -0.800999999999941 | 0.127 | 0.08 | 0.049 |
| -0.797999999999941 | 0.127 | 0.08 | 0.049 |
| -0.794999999999941 | 0.126 | 0.08 | 0.05 |
| -0.791999999999941 | 0.126 | 0.08 | 0.05 |
| -0.788999999999941 | 0.126 | 0.08 | 0.05 |
| -0.785999999999941 | 0.125 | 0.08 | 0.05 |
| -0.782999999999941 | 0.125 | 0.08 | 0.05 |
| -0.779999999999941 | 0.124 | 0.08 | 0.051 |
| -0.776999999999941 | 0.124 | 0.08 | 0.051 |
| -0.773999999999941 | 0.124 | 0.08 | 0.051 |
| -0.770999999999941 | 0.123 | 0.08 | 0.051 |
| -0.767999999999941 | 0.123 | 0.08 | 0.051 |
| -0.764999999999941 | 0.123 | 0.08 | 0.052 |
| -0.761999999999941 | 0.122 | 0.08 | 0.052 |
| -0.758999999999941 | 0.122 | 0.08 | 0.052 |
| -0.755999999999941 | 0.121 | 0.08 | 0.052 |
| -0.752999999999941 | 0.121 | 0.08 | 0.052 |
| -0.749999999999941 | 0.121 | 0.08 | 0.052 |
| -0.746999999999941 | 0.12 | 0.08 | 0.053 |
| -0.743999999999941 | 0.12 | 0.08 | 0.053 |
| -0.740999999999941 | 0.12 | 0.08 | 0.053 |
| -0.737999999999941 | 0.119 | 0.08 | 0.053 |
| -0.734999999999941 | 0.119 | 0.08 | 0.053 |
| -0.731999999999941 | 0.118 | 0.08 | 0.054 |
| -0.728999999999941 | 0.118 | 0.08 | 0.054 |
| -0.725999999999941 | 0.118 | 0.08 | 0.054 |
| -0.722999999999941 | 0.117 | 0.08 | 0.054 |
| -0.719999999999941 | 0.117 | 0.08 | 0.054 |
| -0.716999999999941 | 0.116 | 0.08 | 0.054 |
| -0.713999999999941 | 0.116 | 0.08 | 0.055 |
| -0.710999999999941 | 0.116 | 0.08 | 0.055 |
| -0.707999999999941 | 0.115 | 0.08 | 0.055 |
| -0.704999999999941 | 0.115 | 0.08 | 0.055 |
| -0.701999999999941 | 0.115 | 0.08 | 0.055 |
| -0.698999999999941 | 0.114 | 0.08 | 0.055 |
| -0.695999999999941 | 0.114 | 0.08 | 0.055 |
| -0.692999999999941 | 0.113 | 0.08 | 0.056 |
| -0.689999999999941 | 0.113 | 0.08 | 0.056 |
| -0.686999999999941 | 0.113 | 0.08 | 0.056 |
| -0.683999999999941 | 0.112 | 0.08 | 0.056 |
| -0.680999999999941 | 0.112 | 0.08 | 0.056 |
| -0.677999999999941 | 0.111 | 0.08 | 0.056 |
| -0.674999999999941 | 0.111 | 0.08 | 0.056 |
| -0.671999999999941 | 0.111 | 0.08 | 0.057 |
| -0.668999999999941 | 0.11 | 0.08 | 0.057 |
| -0.665999999999941 | 0.11 | 0.08 | 0.057 |
| -0.662999999999941 | 0.109 | 0.08 | 0.057 |
| -0.659999999999941 | 0.109 | 0.079 | 0.057 |
| -0.656999999999941 | 0.109 | 0.079 | 0.057 |
| -0.653999999999941 | 0.108 | 0.079 | 0.057 |
| -0.650999999999941 | 0.108 | 0.079 | 0.058 |
| -0.647999999999941 | 0.108 | 0.079 | 0.058 |
| -0.644999999999941 | 0.107 | 0.079 | 0.058 |
| -0.641999999999941 | 0.107 | 0.079 | 0.058 |
| -0.638999999999941 | 0.106 | 0.079 | 0.058 |
| -0.635999999999941 | 0.106 | 0.079 | 0.058 |
| -0.632999999999941 | 0.106 | 0.079 | 0.058 |
| -0.629999999999941 | 0.105 | 0.079 | 0.058 |
| -0.626999999999941 | 0.105 | 0.079 | 0.058 |
| -0.623999999999941 | 0.104 | 0.079 | 0.059 |
| -0.620999999999941 | 0.104 | 0.078 | 0.059 |
| -0.617999999999941 | 0.104 | 0.078 | 0.059 |
| -0.614999999999941 | 0.103 | 0.078 | 0.059 |
| -0.611999999999941 | 0.103 | 0.078 | 0.059 |
| -0.608999999999941 | 0.102 | 0.078 | 0.059 |
| -0.605999999999941 | 0.102 | 0.078 | 0.059 |
| -0.602999999999941 | 0.102 | 0.078 | 0.059 |
| -0.599999999999941 | 0.101 | 0.078 | 0.059 |
| -0.596999999999941 | 0.101 | 0.078 | 0.059 |
| -0.593999999999941 | 0.1 | 0.078 | 0.059 |
| -0.590999999999941 | 0.1 | 0.077 | 0.059 |
| -0.587999999999941 | 0.1 | 0.077 | 0.06 |
| -0.584999999999941 | 0.099 | 0.077 | 0.06 |
| -0.581999999999941 | 0.099 | 0.077 | 0.06 |
| -0.578999999999941 | 0.098 | 0.077 | 0.06 |
| -0.575999999999941 | 0.098 | 0.077 | 0.06 |
| -0.572999999999941 | 0.098 | 0.077 | 0.06 |
| -0.569999999999941 | 0.097 | 0.077 | 0.06 |
| -0.566999999999941 | 0.097 | 0.077 | 0.06 |
| -0.563999999999941 | 0.097 | 0.076 | 0.06 |
| -0.560999999999941 | 0.096 | 0.076 | 0.06 |
| -0.557999999999941 | 0.096 | 0.076 | 0.06 |
| -0.554999999999941 | 0.095 | 0.076 | 0.06 |
| -0.551999999999941 | 0.095 | 0.076 | 0.06 |
| -0.548999999999941 | 0.095 | 0.076 | 0.06 |
| -0.545999999999941 | 0.094 | 0.076 | 0.06 |
| -0.542999999999941 | 0.094 | 0.075 | 0.06 |
| -0.539999999999941 | 0.093 | 0.075 | 0.06 |
| -0.536999999999941 | 0.093 | 0.075 | 0.06 |
| -0.533999999999941 | 0.093 | 0.075 | 0.06 |
| -0.530999999999941 | 0.092 | 0.075 | 0.06 |
| -0.527999999999941 | 0.092 | 0.075 | 0.061 |
| -0.524999999999941 | 0.091 | 0.075 | 0.061 |
| -0.521999999999941 | 0.091 | 0.074 | 0.061 |
| -0.518999999999941 | 0.091 | 0.074 | 0.061 |
| -0.515999999999941 | 0.09 | 0.074 | 0.061 |
| -0.512999999999941 | 0.09 | 0.074 | 0.061 |
| -0.509999999999941 | 0.089 | 0.074 | 0.061 |
| -0.506999999999941 | 0.089 | 0.074 | 0.061 |
| -0.503999999999941 | 0.089 | 0.073 | 0.061 |
| -0.500999999999941 | 0.088 | 0.073 | 0.061 |
| -0.497999999999941 | 0.088 | 0.073 | 0.061 |
| -0.494999999999941 | 0.088 | 0.073 | 0.061 |
| -0.491999999999941 | 0.087 | 0.073 | 0.061 |
| -0.488999999999941 | 0.087 | 0.073 | 0.061 |
| -0.485999999999941 | 0.086 | 0.072 | 0.061 |
| -0.482999999999941 | 0.086 | 0.072 | 0.061 |
| -0.479999999999941 | 0.086 | 0.072 | 0.061 |
| -0.476999999999941 | 0.085 | 0.072 | 0.061 |
| -0.473999999999941 | 0.085 | 0.072 | 0.061 |
| -0.470999999999941 | 0.084 | 0.072 | 0.061 |
| -0.467999999999941 | 0.084 | 0.071 | 0.06 |
| -0.464999999999941 | 0.084 | 0.071 | 0.06 |
| -0.461999999999941 | 0.083 | 0.071 | 0.06 |
| -0.458999999999941 | 0.083 | 0.071 | 0.06 |
| -0.455999999999941 | 0.083 | 0.071 | 0.06 |
| -0.452999999999941 | 0.082 | 0.07 | 0.06 |
| -0.449999999999941 | 0.082 | 0.07 | 0.06 |
| -0.446999999999941 | 0.081 | 0.07 | 0.06 |
| -0.443999999999941 | 0.081 | 0.07 | 0.06 |
| -0.440999999999941 | 0.081 | 0.07 | 0.06 |
| -0.437999999999941 | 0.08 | 0.07 | 0.06 |
| -0.434999999999941 | 0.08 | 0.069 | 0.06 |
| -0.431999999999941 | 0.079 | 0.069 | 0.06 |
| -0.428999999999941 | 0.079 | 0.069 | 0.06 |
| -0.425999999999941 | 0.079 | 0.069 | 0.06 |
| -0.422999999999941 | 0.078 | 0.069 | 0.06 |
| -0.419999999999941 | 0.078 | 0.068 | 0.06 |
| -0.416999999999941 | 0.078 | 0.068 | 0.06 |
| -0.413999999999941 | 0.077 | 0.068 | 0.06 |
| -0.410999999999941 | 0.077 | 0.068 | 0.06 |
| -0.407999999999941 | 0.076 | 0.067 | 0.059 |
| -0.404999999999941 | 0.076 | 0.067 | 0.059 |
| -0.401999999999941 | 0.076 | 0.067 | 0.059 |
| -0.398999999999941 | 0.075 | 0.067 | 0.059 |
| -0.395999999999941 | 0.075 | 0.067 | 0.059 |
| -0.392999999999941 | 0.075 | 0.066 | 0.059 |
| -0.389999999999941 | 0.074 | 0.066 | 0.059 |
| -0.386999999999941 | 0.074 | 0.066 | 0.059 |
| -0.383999999999941 | 0.074 | 0.066 | 0.059 |
| -0.380999999999941 | 0.073 | 0.066 | 0.059 |
| -0.377999999999941 | 0.073 | 0.065 | 0.059 |
| -0.374999999999941 | 0.072 | 0.065 | 0.058 |
| -0.371999999999941 | 0.072 | 0.065 | 0.058 |
| -0.368999999999941 | 0.072 | 0.065 | 0.058 |
| -0.365999999999941 | 0.071 | 0.064 | 0.058 |
| -0.362999999999941 | 0.071 | 0.064 | 0.058 |
| -0.359999999999941 | 0.071 | 0.064 | 0.058 |
| -0.356999999999941 | 0.07 | 0.064 | 0.058 |
| -0.353999999999941 | 0.07 | 0.064 | 0.058 |
| -0.350999999999941 | 0.069 | 0.063 | 0.058 |
| -0.347999999999941 | 0.069 | 0.063 | 0.057 |
| -0.344999999999941 | 0.069 | 0.063 | 0.057 |
| -0.341999999999941 | 0.068 | 0.063 | 0.057 |
| -0.338999999999941 | 0.068 | 0.062 | 0.057 |
| -0.335999999999941 | 0.068 | 0.062 | 0.057 |
| -0.332999999999941 | 0.067 | 0.062 | 0.057 |
| -0.329999999999941 | 0.067 | 0.062 | 0.057 |
| -0.326999999999941 | 0.067 | 0.061 | 0.057 |
| -0.323999999999941 | 0.066 | 0.061 | 0.056 |
| -0.320999999999941 | 0.066 | 0.061 | 0.056 |
| -0.317999999999941 | 0.066 | 0.061 | 0.056 |
| -0.314999999999941 | 0.065 | 0.06 | 0.056 |
| -0.311999999999941 | 0.065 | 0.06 | 0.056 |
| -0.308999999999941 | 0.065 | 0.06 | 0.056 |
| -0.305999999999941 | 0.064 | 0.06 | 0.056 |
| -0.302999999999941 | 0.064 | 0.059 | 0.055 |
| -0.299999999999941 | 0.063 | 0.059 | 0.055 |
| -0.296999999999941 | 0.063 | 0.059 | 0.055 |
| -0.293999999999941 | 0.063 | 0.059 | 0.055 |
| -0.290999999999941 | 0.062 | 0.059 | 0.055 |
| -0.287999999999941 | 0.062 | 0.058 | 0.055 |
| -0.284999999999941 | 0.062 | 0.058 | 0.054 |
| -0.281999999999941 | 0.061 | 0.058 | 0.054 |
| -0.278999999999941 | 0.061 | 0.058 | 0.054 |
| -0.275999999999941 | 0.061 | 0.057 | 0.054 |
| -0.272999999999941 | 0.06 | 0.057 | 0.054 |
| -0.269999999999941 | 0.06 | 0.057 | 0.054 |
| -0.266999999999941 | 0.06 | 0.057 | 0.053 |
| -0.263999999999941 | 0.059 | 0.056 | 0.053 |
| -0.260999999999941 | 0.059 | 0.056 | 0.053 |
| -0.257999999999941 | 0.059 | 0.056 | 0.053 |
| -0.254999999999941 | 0.058 | 0.055 | 0.053 |
| -0.251999999999941 | 0.058 | 0.055 | 0.053 |
| -0.248999999999941 | 0.058 | 0.055 | 0.052 |
| -0.245999999999941 | 0.057 | 0.055 | 0.052 |
| -0.242999999999941 | 0.057 | 0.054 | 0.052 |
| -0.239999999999941 | 0.057 | 0.054 | 0.052 |
| -0.236999999999941 | 0.056 | 0.054 | 0.052 |
| -0.233999999999941 | 0.056 | 0.054 | 0.051 |
| -0.230999999999941 | 0.056 | 0.053 | 0.051 |
| -0.227999999999941 | 0.055 | 0.053 | 0.051 |
| -0.224999999999941 | 0.055 | 0.053 | 0.051 |
| -0.221999999999941 | 0.055 | 0.053 | 0.051 |
| -0.218999999999941 | 0.054 | 0.052 | 0.051 |
| -0.215999999999941 | 0.054 | 0.052 | 0.05 |
| -0.212999999999941 | 0.054 | 0.052 | 0.05 |
| -0.209999999999941 | 0.053 | 0.052 | 0.05 |
| -0.206999999999941 | 0.053 | 0.051 | 0.05 |
| -0.203999999999941 | 0.053 | 0.051 | 0.049 |
| -0.200999999999941 | 0.052 | 0.051 | 0.049 |
| -0.197999999999941 | 0.052 | 0.051 | 0.049 |
| -0.194999999999941 | 0.052 | 0.05 | 0.049 |
| -0.191999999999941 | 0.052 | 0.05 | 0.049 |
| -0.188999999999941 | 0.051 | 0.05 | 0.048 |
| -0.185999999999941 | 0.051 | 0.05 | 0.048 |
| -0.182999999999941 | 0.051 | 0.049 | 0.048 |
| -0.179999999999941 | 0.05 | 0.049 | 0.048 |
| -0.176999999999941 | 0.05 | 0.049 | 0.048 |
| -0.173999999999941 | 0.05 | 0.049 | 0.047 |
| -0.170999999999941 | 0.049 | 0.048 | 0.047 |
| -0.167999999999941 | 0.049 | 0.048 | 0.047 |
| -0.164999999999941 | 0.049 | 0.048 | 0.047 |
| -0.161999999999941 | 0.048 | 0.047 | 0.047 |
| -0.158999999999941 | 0.048 | 0.047 | 0.046 |
| -0.155999999999941 | 0.048 | 0.047 | 0.046 |
| -0.152999999999941 | 0.048 | 0.047 | 0.046 |
| -0.149999999999941 | 0.047 | 0.046 | 0.046 |
| -0.146999999999941 | 0.047 | 0.046 | 0.045 |
| -0.143999999999941 | 0.047 | 0.046 | 0.045 |
| -0.140999999999941 | 0.046 | 0.046 | 0.045 |
| -0.137999999999941 | 0.046 | 0.045 | 0.045 |
| -0.134999999999941 | 0.046 | 0.045 | 0.044 |
| -0.131999999999941 | 0.045 | 0.045 | 0.044 |
| -0.128999999999941 | 0.045 | 0.045 | 0.044 |
| -0.125999999999941 | 0.045 | 0.044 | 0.044 |
| -0.122999999999941 | 0.045 | 0.044 | 0.044 |
| -0.119999999999941 | 0.044 | 0.044 | 0.043 |
| -0.116999999999941 | 0.044 | 0.044 | 0.043 |
| -0.113999999999941 | 0.044 | 0.043 | 0.043 |
| -0.110999999999941 | 0.043 | 0.043 | 0.043 |
| -0.107999999999941 | 0.043 | 0.043 | 0.042 |
| -0.104999999999941 | 0.043 | 0.043 | 0.042 |
| -0.101999999999941 | 0.043 | 0.042 | 0.042 |
| -0.0989999999999406 | 0.042 | 0.042 | 0.042 |
| -0.0959999999999406 | 0.042 | 0.042 | 0.041 |
| -0.0929999999999405 | 0.042 | 0.041 | 0.041 |
| -0.0899999999999406 | 0.041 | 0.041 | 0.041 |
| -0.0869999999999406 | 0.041 | 0.041 | 0.041 |
| -0.0839999999999405 | 0.041 | 0.041 | 0.04 |
| -0.0809999999999405 | 0.041 | 0.04 | 0.04 |
| -0.0779999999999406 | 0.04 | 0.04 | 0.04 |
| -0.0749999999999406 | 0.04 | 0.04 | 0.04 |
| -0.0719999999999405 | 0.04 | 0.04 | 0.04 |
| -0.0689999999999405 | 0.04 | 0.039 | 0.039 |
| -0.0659999999999405 | 0.039 | 0.039 | 0.039 |
| -0.0629999999999405 | 0.039 | 0.039 | 0.039 |
| -0.0599999999999405 | 0.039 | 0.039 | 0.039 |
| -0.0569999999999405 | 0.039 | 0.038 | 0.038 |
| -0.0539999999999405 | 0.038 | 0.038 | 0.038 |
| -0.0509999999999405 | 0.038 | 0.038 | 0.038 |
| -0.0479999999999405 | 0.038 | 0.038 | 0.038 |
| -0.0449999999999405 | 0.037 | 0.037 | 0.037 |
| -0.0419999999999405 | 0.037 | 0.037 | 0.037 |
| -0.0389999999999405 | 0.037 | 0.037 | 0.037 |
| -0.0359999999999405 | 0.037 | 0.037 | 0.037 |
| -0.0329999999999405 | 0.036 | 0.036 | 0.036 |
| -0.0299999999999405 | 0.036 | 0.036 | 0.036 |
| -0.0269999999999405 | 0.036 | 0.036 | 0.036 |
| -0.0239999999999405 | 0.036 | 0.036 | 0.036 |
| -0.0209999999999405 | 0.035 | 0.035 | 0.035 |
| -0.0179999999999405 | 0.035 | 0.035 | 0.035 |
| -0.0149999999999405 | 0.035 | 0.035 | 0.035 |
| -0.0119999999999405 | 0.035 | 0.035 | 0.035 |
| -0.00899999999994053 | 0.034 | 0.034 | 0.034 |
| -0.00599999999994053 | 0.034 | 0.034 | 0.034 |
| -0.00299999999994053 | 0.034 | 0.034 | 0.034 |
| 5.94723922886509e-14 | 0.034 | 0.034 | 0.034 |
| 0.00300000000005947 | 0.033 | 0.033 | 0.033 |
| 0.00600000000005947 | 0.033 | 0.033 | 0.033 |
| 0.00900000000005947 | 0.033 | 0.033 | 0.033 |
| 0.0120000000000595 | 0.033 | 0.033 | 0.033 |
| 0.0150000000000595 | 0.032 | 0.032 | 0.032 |
| 0.0180000000000595 | 0.032 | 0.032 | 0.032 |
| 0.0210000000000595 | 0.032 | 0.032 | 0.032 |
| 0.0240000000000595 | 0.032 | 0.032 | 0.032 |
| 0.0270000000000595 | 0.032 | 0.032 | 0.032 |
| 0.0300000000000595 | 0.031 | 0.031 | 0.031 |
| 0.0330000000000595 | 0.031 | 0.031 | 0.031 |
| 0.0360000000000595 | 0.031 | 0.031 | 0.031 |
| 0.0390000000000595 | 0.031 | 0.031 | 0.031 |
| 0.0420000000000595 | 0.03 | 0.03 | 0.03 |
| 0.0450000000000595 | 0.03 | 0.03 | 0.03 |
| 0.0480000000000595 | 0.03 | 0.03 | 0.03 |
| 0.0510000000000595 | 0.03 | 0.03 | 0.03 |
| 0.0540000000000595 | 0.03 | 0.029 | 0.029 |
| 0.0570000000000595 | 0.029 | 0.029 | 0.029 |
| 0.0600000000000595 | 0.029 | 0.029 | 0.029 |
| 0.0630000000000595 | 0.029 | 0.029 | 0.029 |
| 0.0660000000000595 | 0.029 | 0.029 | 0.028 |
| 0.0690000000000595 | 0.028 | 0.028 | 0.028 |
| 0.0720000000000595 | 0.028 | 0.028 | 0.028 |
| 0.0750000000000595 | 0.028 | 0.028 | 0.028 |
| 0.0780000000000595 | 0.028 | 0.028 | 0.027 |
| 0.0810000000000595 | 0.028 | 0.027 | 0.027 |
| 0.0840000000000595 | 0.027 | 0.027 | 0.027 |
| 0.0870000000000595 | 0.027 | 0.027 | 0.027 |
| 0.0900000000000595 | 0.027 | 0.027 | 0.027 |
| 0.0930000000000595 | 0.027 | 0.027 | 0.026 |
| 0.0960000000000595 | 0.027 | 0.026 | 0.026 |
| 0.0990000000000595 | 0.026 | 0.026 | 0.026 |
| 0.10200000000006 | 0.026 | 0.026 | 0.026 |
| 0.10500000000006 | 0.026 | 0.026 | 0.025 |
| 0.10800000000006 | 0.026 | 0.025 | 0.025 |
| 0.11100000000006 | 0.025 | 0.025 | 0.025 |
| 0.11400000000006 | 0.025 | 0.025 | 0.025 |
| 0.11700000000006 | 0.025 | 0.025 | 0.025 |
| 0.12000000000006 | 0.025 | 0.025 | 0.024 |
| 0.12300000000006 | 0.025 | 0.024 | 0.024 |
| 0.12600000000006 | 0.025 | 0.024 | 0.024 |
| 0.12900000000006 | 0.024 | 0.024 | 0.024 |
| 0.13200000000006 | 0.024 | 0.024 | 0.023 |
| 0.13500000000006 | 0.024 | 0.024 | 0.023 |
| 0.13800000000006 | 0.024 | 0.023 | 0.023 |
| 0.14100000000006 | 0.024 | 0.023 | 0.023 |
| 0.14400000000006 | 0.023 | 0.023 | 0.023 |
| 0.14700000000006 | 0.023 | 0.023 | 0.022 |
| 0.15000000000006 | 0.023 | 0.023 | 0.022 |
| 0.15300000000006 | 0.023 | 0.022 | 0.022 |
| 0.15600000000006 | 0.023 | 0.022 | 0.022 |
| 0.15900000000006 | 0.022 | 0.022 | 0.022 |
| 0.16200000000006 | 0.022 | 0.022 | 0.021 |
| 0.16500000000006 | 0.022 | 0.022 | 0.021 |
| 0.16800000000006 | 0.022 | 0.021 | 0.021 |
| 0.17100000000006 | 0.022 | 0.021 | 0.021 |
| 0.17400000000006 | 0.022 | 0.021 | 0.02 |
| 0.17700000000006 | 0.021 | 0.021 | 0.02 |
| 0.18000000000006 | 0.021 | 0.021 | 0.02 |
| 0.18300000000006 | 0.021 | 0.02 | 0.02 |
| 0.18600000000006 | 0.021 | 0.02 | 0.02 |
| 0.18900000000006 | 0.021 | 0.02 | 0.019 |
| 0.19200000000006 | 0.02 | 0.02 | 0.019 |
| 0.19500000000006 | 0.02 | 0.02 | 0.019 |
| 0.19800000000006 | 0.02 | 0.02 | 0.019 |
| 0.20100000000006 | 0.02 | 0.019 | 0.019 |
| 0.20400000000006 | 0.02 | 0.019 | 0.019 |
| 0.20700000000006 | 0.02 | 0.019 | 0.018 |
| 0.21000000000006 | 0.019 | 0.019 | 0.018 |
| 0.21300000000006 | 0.019 | 0.019 | 0.018 |
| 0.21600000000006 | 0.019 | 0.018 | 0.018 |
| 0.21900000000006 | 0.019 | 0.018 | 0.018 |
| 0.22200000000006 | 0.019 | 0.018 | 0.017 |
| 0.22500000000006 | 0.019 | 0.018 | 0.017 |
| 0.22800000000006 | 0.019 | 0.018 | 0.017 |
| 0.23100000000006 | 0.018 | 0.018 | 0.017 |
| 0.23400000000006 | 0.018 | 0.017 | 0.017 |
| 0.23700000000006 | 0.018 | 0.017 | 0.016 |
| 0.24000000000006 | 0.018 | 0.017 | 0.016 |
| 0.24300000000006 | 0.018 | 0.017 | 0.016 |
| 0.24600000000006 | 0.018 | 0.017 | 0.016 |
| 0.24900000000006 | 0.017 | 0.017 | 0.016 |
| 0.25200000000006 | 0.017 | 0.016 | 0.016 |
| 0.25500000000006 | 0.017 | 0.016 | 0.015 |
| 0.25800000000006 | 0.017 | 0.016 | 0.015 |
| 0.26100000000006 | 0.017 | 0.016 | 0.015 |
| 0.26400000000006 | 0.017 | 0.016 | 0.015 |
| 0.26700000000006 | 0.017 | 0.016 | 0.015 |
| 0.27000000000006 | 0.016 | 0.015 | 0.015 |
| 0.27300000000006 | 0.016 | 0.015 | 0.014 |
| 0.27600000000006 | 0.016 | 0.015 | 0.014 |
| 0.27900000000006 | 0.016 | 0.015 | 0.014 |
| 0.28200000000006 | 0.016 | 0.015 | 0.014 |
| 0.28500000000006 | 0.016 | 0.015 | 0.014 |
| 0.28800000000006 | 0.016 | 0.015 | 0.014 |
| 0.29100000000006 | 0.015 | 0.014 | 0.013 |
| 0.29400000000006 | 0.015 | 0.014 | 0.013 |
| 0.29700000000006 | 0.015 | 0.014 | 0.013 |
| 0.30000000000006 | 0.015 | 0.014 | 0.013 |
| 0.30300000000006 | 0.015 | 0.014 | 0.013 |
| 0.30600000000006 | 0.015 | 0.014 | 0.013 |
| 0.30900000000006 | 0.015 | 0.013 | 0.012 |
| 0.31200000000006 | 0.014 | 0.013 | 0.012 |
| 0.31500000000006 | 0.014 | 0.013 | 0.012 |
| 0.31800000000006 | 0.014 | 0.013 | 0.012 |
| 0.32100000000006 | 0.014 | 0.013 | 0.012 |
| 0.32400000000006 | 0.014 | 0.013 | 0.012 |
| 0.32700000000006 | 0.014 | 0.013 | 0.012 |
| 0.33000000000006 | 0.014 | 0.013 | 0.011 |
| 0.33300000000006 | 0.014 | 0.012 | 0.011 |
| 0.33600000000006 | 0.013 | 0.012 | 0.011 |
| 0.33900000000006 | 0.013 | 0.012 | 0.011 |
| 0.34200000000006 | 0.013 | 0.012 | 0.011 |
| 0.34500000000006 | 0.013 | 0.012 | 0.011 |
| 0.34800000000006 | 0.013 | 0.012 | 0.011 |
| 0.35100000000006 | 0.013 | 0.012 | 0.01 |
| 0.35400000000006 | 0.013 | 0.011 | 0.01 |
| 0.35700000000006 | 0.013 | 0.011 | 0.01 |
| 0.36000000000006 | 0.012 | 0.011 | 0.01 |
| 0.36300000000006 | 0.012 | 0.011 | 0.01 |
| 0.36600000000006 | 0.012 | 0.011 | 0.01 |
| 0.36900000000006 | 0.012 | 0.011 | 0.01 |
| 0.37200000000006 | 0.012 | 0.011 | 0.01 |
| 0.37500000000006 | 0.012 | 0.011 | 0.009 |
| 0.37800000000006 | 0.012 | 0.01 | 0.009 |
| 0.38100000000006 | 0.012 | 0.01 | 0.009 |
| 0.38400000000006 | 0.012 | 0.01 | 0.009 |
| 0.38700000000006 | 0.011 | 0.01 | 0.009 |
| 0.39000000000006 | 0.011 | 0.01 | 0.009 |
| 0.39300000000006 | 0.011 | 0.01 | 0.009 |
| 0.39600000000006 | 0.011 | 0.01 | 0.009 |
| 0.39900000000006 | 0.011 | 0.01 | 0.008 |
| 0.40200000000006 | 0.011 | 0.01 | 0.008 |
| 0.40500000000006 | 0.011 | 0.009 | 0.008 |
| 0.40800000000006 | 0.011 | 0.009 | 0.008 |
| 0.41100000000006 | 0.011 | 0.009 | 0.008 |
| 0.41400000000006 | 0.011 | 0.009 | 0.008 |
| 0.41700000000006 | 0.01 | 0.009 | 0.008 |
| 0.42000000000006 | 0.01 | 0.009 | 0.008 |
| 0.42300000000006 | 0.01 | 0.009 | 0.008 |
| 0.42600000000006 | 0.01 | 0.009 | 0.007 |
| 0.42900000000006 | 0.01 | 0.009 | 0.007 |
| 0.43200000000006 | 0.01 | 0.008 | 0.007 |
| 0.43500000000006 | 0.01 | 0.008 | 0.007 |
| 0.43800000000006 | 0.01 | 0.008 | 0.007 |
| 0.44100000000006 | 0.01 | 0.008 | 0.007 |
| 0.44400000000006 | 0.01 | 0.008 | 0.007 |
| 0.44700000000006 | 0.009 | 0.008 | 0.007 |
| 0.45000000000006 | 0.009 | 0.008 | 0.007 |
| 0.45300000000006 | 0.009 | 0.008 | 0.007 |
| 0.45600000000006 | 0.009 | 0.008 | 0.006 |
| 0.45900000000006 | 0.009 | 0.008 | 0.006 |
| 0.46200000000006 | 0.009 | 0.007 | 0.006 |
| 0.46500000000006 | 0.009 | 0.007 | 0.006 |
| 0.46800000000006 | 0.009 | 0.007 | 0.006 |
| 0.47100000000006 | 0.009 | 0.007 | 0.006 |
| 0.47400000000006 | 0.009 | 0.007 | 0.006 |
| 0.47700000000006 | 0.009 | 0.007 | 0.006 |
| 0.48000000000006 | 0.008 | 0.007 | 0.006 |
| 0.48300000000006 | 0.008 | 0.007 | 0.006 |
| 0.48600000000006 | 0.008 | 0.007 | 0.006 |
| 0.48900000000006 | 0.008 | 0.007 | 0.005 |
| 0.49200000000006 | 0.008 | 0.007 | 0.005 |
| 0.49500000000006 | 0.008 | 0.007 | 0.005 |
| 0.49800000000006 | 0.008 | 0.006 | 0.005 |
| 0.50100000000006 | 0.008 | 0.006 | 0.005 |
| 0.50400000000006 | 0.008 | 0.006 | 0.005 |
| 0.50700000000006 | 0.008 | 0.006 | 0.005 |
| 0.51000000000006 | 0.008 | 0.006 | 0.005 |
| 0.51300000000006 | 0.008 | 0.006 | 0.005 |
| 0.51600000000006 | 0.007 | 0.006 | 0.005 |
| 0.51900000000006 | 0.007 | 0.006 | 0.005 |
| 0.52200000000006 | 0.007 | 0.006 | 0.005 |
| 0.52500000000006 | 0.007 | 0.006 | 0.005 |
| 0.52800000000006 | 0.007 | 0.006 | 0.004 |
| 0.53100000000006 | 0.007 | 0.006 | 0.004 |
| 0.53400000000006 | 0.007 | 0.006 | 0.004 |
| 0.53700000000006 | 0.007 | 0.005 | 0.004 |
| 0.54000000000006 | 0.007 | 0.005 | 0.004 |
| 0.54300000000006 | 0.007 | 0.005 | 0.004 |
| 0.54600000000006 | 0.007 | 0.005 | 0.004 |
| 0.54900000000006 | 0.007 | 0.005 | 0.004 |
| 0.55200000000006 | 0.007 | 0.005 | 0.004 |
| 0.55500000000006 | 0.007 | 0.005 | 0.004 |
| 0.55800000000006 | 0.006 | 0.005 | 0.004 |
| 0.56100000000006 | 0.006 | 0.005 | 0.004 |
| 0.56400000000006 | 0.006 | 0.005 | 0.004 |
| 0.56700000000006 | 0.006 | 0.005 | 0.004 |
| 0.57000000000006 | 0.006 | 0.005 | 0.004 |
| 0.57300000000006 | 0.006 | 0.005 | 0.003 |
| 0.57600000000006 | 0.006 | 0.005 | 0.003 |
| 0.57900000000006 | 0.006 | 0.004 | 0.003 |
| 0.58200000000006 | 0.006 | 0.004 | 0.003 |
| 0.58500000000006 | 0.006 | 0.004 | 0.003 |
| 0.58800000000006 | 0.006 | 0.004 | 0.003 |
| 0.59100000000006 | 0.006 | 0.004 | 0.003 |
| 0.59400000000006 | 0.006 | 0.004 | 0.003 |
| 0.59700000000006 | 0.006 | 0.004 | 0.003 |
| 0.60000000000006 | 0.006 | 0.004 | 0.003 |
| 0.60300000000006 | 0.006 | 0.004 | 0.003 |
| 0.60600000000006 | 0.005 | 0.004 | 0.003 |
| 0.60900000000006 | 0.005 | 0.004 | 0.003 |
| 0.61200000000006 | 0.005 | 0.004 | 0.003 |
| 0.61500000000006 | 0.005 | 0.004 | 0.003 |
| 0.61800000000006 | 0.005 | 0.004 | 0.003 |
| 0.62100000000006 | 0.005 | 0.004 | 0.003 |
| 0.62400000000006 | 0.005 | 0.004 | 0.003 |
| 0.62700000000006 | 0.005 | 0.004 | 0.003 |
| 0.63000000000006 | 0.005 | 0.004 | 0.003 |
| 0.63300000000006 | 0.005 | 0.003 | 0.002 |
| 0.63600000000006 | 0.005 | 0.003 | 0.002 |
| 0.63900000000006 | 0.005 | 0.003 | 0.002 |
| 0.64200000000006 | 0.005 | 0.003 | 0.002 |
| 0.64500000000006 | 0.005 | 0.003 | 0.002 |
| 0.64800000000006 | 0.005 | 0.003 | 0.002 |
| 0.65100000000006 | 0.005 | 0.003 | 0.002 |
| 0.65400000000006 | 0.005 | 0.003 | 0.002 |
| 0.65700000000006 | 0.005 | 0.003 | 0.002 |
| 0.66000000000006 | 0.004 | 0.003 | 0.002 |
| 0.66300000000006 | 0.004 | 0.003 | 0.002 |
| 0.66600000000006 | 0.004 | 0.003 | 0.002 |
| 0.66900000000006 | 0.004 | 0.003 | 0.002 |
| 0.67200000000006 | 0.004 | 0.003 | 0.002 |
| 0.67500000000006 | 0.004 | 0.003 | 0.002 |
| 0.67800000000006 | 0.004 | 0.003 | 0.002 |
| 0.68100000000006 | 0.004 | 0.003 | 0.002 |
| 0.68400000000006 | 0.004 | 0.003 | 0.002 |
| 0.68700000000006 | 0.004 | 0.003 | 0.002 |
| 0.69000000000006 | 0.004 | 0.003 | 0.002 |
| 0.69300000000006 | 0.004 | 0.003 | 0.002 |
| 0.69600000000006 | 0.004 | 0.003 | 0.002 |
| 0.69900000000006 | 0.004 | 0.003 | 0.002 |
| 0.70200000000006 | 0.004 | 0.002 | 0.002 |
| 0.70500000000006 | 0.004 | 0.002 | 0.002 |
| 0.70800000000006 | 0.004 | 0.002 | 0.002 |
| 0.71100000000006 | 0.004 | 0.002 | 0.002 |
| 0.71400000000006 | 0.004 | 0.002 | 0.001 |
| 0.71700000000006 | 0.004 | 0.002 | 0.001 |
| 0.72000000000006 | 0.004 | 0.002 | 0.001 |
| 0.72300000000006 | 0.004 | 0.002 | 0.001 |
| 0.72600000000006 | 0.003 | 0.002 | 0.001 |
| 0.72900000000006 | 0.003 | 0.002 | 0.001 |
| 0.73200000000006 | 0.003 | 0.002 | 0.001 |
| 0.73500000000006 | 0.003 | 0.002 | 0.001 |
| 0.73800000000006 | 0.003 | 0.002 | 0.001 |
| 0.74100000000006 | 0.003 | 0.002 | 0.001 |
| 0.74400000000006 | 0.003 | 0.002 | 0.001 |
| 0.74700000000006 | 0.003 | 0.002 | 0.001 |
| 0.75000000000006 | 0.003 | 0.002 | 0.001 |
| 0.75300000000006 | 0.003 | 0.002 | 0.001 |
| 0.75600000000006 | 0.003 | 0.002 | 0.001 |
| 0.75900000000006 | 0.003 | 0.002 | 0.001 |
| 0.76200000000006 | 0.003 | 0.002 | 0.001 |
| 0.76500000000006 | 0.003 | 0.002 | 0.001 |
| 0.76800000000006 | 0.003 | 0.002 | 0.001 |
| 0.77100000000006 | 0.003 | 0.002 | 0.001 |
| 0.77400000000006 | 0.003 | 0.002 | 0.001 |
| 0.77700000000006 | 0.003 | 0.002 | 0.001 |
| 0.78000000000006 | 0.003 | 0.002 | 0.001 |
| 0.78300000000006 | 0.003 | 0.002 | 0.001 |
| 0.78600000000006 | 0.003 | 0.002 | 0.001 |
| 0.78900000000006 | 0.003 | 0.002 | 0.001 |
| 0.79200000000006 | 0.003 | 0.002 | 0.001 |
| 0.79500000000006 | 0.003 | 0.002 | 0.001 |
| 0.79800000000006 | 0.003 | 0.001 | 0.001 |
| 0.80100000000006 | 0.003 | 0.001 | 0.001 |
| 0.80400000000006 | 0.003 | 0.001 | 0.001 |
| 0.80700000000006 | 0.003 | 0.001 | 0.001 |
| 0.81000000000006 | 0.002 | 0.001 | 0.001 |
| 0.81300000000006 | 0.002 | 0.001 | 0.001 |
| 0.81600000000006 | 0.002 | 0.001 | 0.001 |
| 0.81900000000006 | 0.002 | 0.001 | 0.001 |
| 0.82200000000006 | 0.002 | 0.001 | 0.001 |
| 0.82500000000006 | 0.002 | 0.001 | 0.001 |
| 0.82800000000006 | 0.002 | 0.001 | 0.001 |
| 0.83100000000006 | 0.002 | 0.001 | 0.001 |
| 0.83400000000006 | 0.002 | 0.001 | 0.001 |
| 0.83700000000006 | 0.002 | 0.001 | 0.001 |
| 0.84000000000006 | 0.002 | 0.001 | 0.001 |
| 0.84300000000006 | 0.002 | 0.001 | 0.001 |
| 0.84600000000006 | 0.002 | 0.001 | 0.001 |
| 0.84900000000006 | 0.002 | 0.001 | 0.001 |
| 0.85200000000006 | 0.002 | 0.001 | 0.001 |
| 0.85500000000006 | 0.002 | 0.001 | 0.001 |
| 0.85800000000006 | 0.002 | 0.001 | 0.001 |
| 0.86100000000006 | 0.002 | 0.001 | 0.001 |
| 0.86400000000006 | 0.002 | 0.001 | 0.001 |
| 0.86700000000006 | 0.002 | 0.001 | 0.001 |
| 0.87000000000006 | 0.002 | 0.001 | 0.001 |
| 0.87300000000006 | 0.002 | 0.001 | 0 |
| 0.87600000000006 | 0.002 | 0.001 | 0 |
| 0.87900000000006 | 0.002 | 0.001 | 0 |
| 0.88200000000006 | 0.002 | 0.001 | 0 |
| 0.88500000000006 | 0.002 | 0.001 | 0 |
| 0.88800000000006 | 0.002 | 0.001 | 0 |
| 0.89100000000006 | 0.002 | 0.001 | 0 |
| 0.89400000000006 | 0.002 | 0.001 | 0 |
| 0.89700000000006 | 0.002 | 0.001 | 0 |
| 0.90000000000006 | 0.002 | 0.001 | 0 |
| 0.90300000000006 | 0.002 | 0.001 | 0 |
| 0.90600000000006 | 0.002 | 0.001 | 0 |
| 0.90900000000006 | 0.002 | 0.001 | 0 |
| 0.91200000000006 | 0.002 | 0.001 | 0 |
| 0.91500000000006 | 0.002 | 0.001 | 0 |
| 0.91800000000006 | 0.002 | 0.001 | 0 |
| 0.92100000000006 | 0.002 | 0.001 | 0 |
| 0.92400000000006 | 0.002 | 0.001 | 0 |
| 0.92700000000006 | 0.002 | 0.001 | 0 |
| 0.93000000000006 | 0.002 | 0.001 | 0 |
| 0.93300000000006 | 0.001 | 0.001 | 0 |
| 0.93600000000006 | 0.001 | 0.001 | 0 |
| 0.93900000000006 | 0.001 | 0.001 | 0 |
| 0.94200000000006 | 0.001 | 0.001 | 0 |
| 0.94500000000006 | 0.001 | 0.001 | 0 |
| 0.94800000000006 | 0.001 | 0.001 | 0 |
| 0.95100000000006 | 0.001 | 0.001 | 0 |
| 0.95400000000006 | 0.001 | 0.001 | 0 |
| 0.95700000000006 | 0.001 | 0.001 | 0 |
| 0.96000000000006 | 0.001 | 0.001 | 0 |
| 0.96300000000006 | 0.001 | 0.001 | 0 |
| 0.96600000000006 | 0.001 | 0.001 | 0 |
| 0.96900000000006 | 0.001 | 0.001 | 0 |
| 0.97200000000006 | 0.001 | 0.001 | 0 |
| 0.97500000000006 | 0.001 | 0.001 | 0 |
| 0.97800000000006 | 0.001 | 0.001 | 0 |
| 0.98100000000006 | 0.001 | 0.001 | 0 |
| 0.98400000000006 | 0.001 | 0.001 | 0 |
| 0.98700000000006 | 0.001 | 0 | 0 |
| 0.99000000000006 | 0.001 | 0 | 0 |
| 0.99300000000006 | 0.001 | 0 | 0 |
| 0.99600000000006 | 0.001 | 0 | 0 |
| 0.99900000000006 | 0.001 | 0 | 0 |
| 1.00200000000006 | 0.001 | 0 | 0 |
| 1.00500000000006 | 0.001 | 0 | 0 |
| 1.00800000000006 | 0.001 | 0 | 0 |
| 1.01100000000006 | 0.001 | 0 | 0 |
| 1.01400000000006 | 0.001 | 0 | 0 |
| 1.01700000000006 | 0.001 | 0 | 0 |
| 1.02000000000006 | 0.001 | 0 | 0 |
| 1.023000000000059 | 0.001 | 0 | 0 |
| 1.026000000000059 | 0.001 | 0 | 0 |
| 1.029000000000059 | 0.001 | 0 | 0 |
| 1.03200000000006 | 0.001 | 0 | 0 |
| 1.035000000000059 | 0.001 | 0 | 0 |
| 1.038000000000059 | 0.001 | 0 | 0 |
| 1.041000000000059 | 0.001 | 0 | 0 |
| 1.044000000000059 | 0.001 | 0 | 0 |
| 1.047000000000059 | 0.001 | 0 | 0 |
| 1.050000000000058 | 0.001 | 0 | 0 |
| 1.053000000000058 | 0.001 | 0 | 0 |
| 1.056000000000058 | 0.001 | 0 | 0 |
| 1.059000000000058 | 0.001 | 0 | 0 |
| 1.062000000000058 | 0.001 | 0 | 0 |
| 1.065000000000058 | 0.001 | 0 | 0 |
| 1.068000000000058 | 0.001 | 0 | 0 |
| 1.071000000000058 | 0.001 | 0 | 0 |
| 1.074000000000058 | 0.001 | 0 | 0 |
| 1.077000000000057 | 0.001 | 0 | 0 |
| 1.080000000000057 | 0.001 | 0 | 0 |
| 1.083000000000057 | 0.001 | 0 | 0 |
| 1.086000000000057 | 0.001 | 0 | 0 |
| 1.089000000000057 | 0.001 | 0 | 0 |
| 1.092000000000057 | 0.001 | 0 | 0 |
| 1.095000000000057 | 0.001 | 0 | 0 |
| 1.098000000000057 | 0.001 | 0 | 0 |
| 1.101000000000057 | 0.001 | 0 | 0 |
| 1.104000000000056 | 0.001 | 0 | 0 |
| 1.107000000000056 | 0.001 | 0 | 0 |
| 1.110000000000056 | 0.001 | 0 | 0 |
| 1.113000000000056 | 0.001 | 0 | 0 |
| 1.116000000000056 | 0.001 | 0 | 0 |
| 1.119000000000056 | 0.001 | 0 | 0 |
| 1.122000000000056 | 0.001 | 0 | 0 |
| 1.125000000000056 | 0.001 | 0 | 0 |
| 1.128000000000056 | 0.001 | 0 | 0 |
| 1.131000000000056 | 0.001 | 0 | 0 |
| 1.134000000000055 | 0.001 | 0 | 0 |
| 1.137000000000055 | 0.001 | 0 | 0 |
| 1.140000000000055 | 0.001 | 0 | 0 |
| 1.143000000000055 | 0.001 | 0 | 0 |
| 1.146000000000055 | 0.001 | 0 | 0 |
| 1.149000000000055 | 0.001 | 0 | 0 |
| 1.152000000000055 | 0.001 | 0 | 0 |
| 1.155000000000055 | 0.001 | 0 | 0 |
| 1.158000000000055 | 0.001 | 0 | 0 |
| 1.161000000000054 | 0.001 | 0 | 0 |
| 1.164000000000054 | 0.001 | 0 | 0 |
| 1.167000000000054 | 0.001 | 0 | 0 |
| 1.170000000000054 | 0.001 | 0 | 0 |
| 1.173000000000054 | 0 | 0 | 0 |
| 1.176000000000054 | 0 | 0 | 0 |
| 1.179000000000054 | 0 | 0 | 0 |
| 1.182000000000054 | 0 | 0 | 0 |
| 1.185000000000054 | 0 | 0 | 0 |
| 1.188000000000053 | 0 | 0 | 0 |
| 1.191000000000053 | 0 | 0 | 0 |
| 1.194000000000053 | 0 | 0 | 0 |
| 1.197000000000053 | 0 | 0 | 0 |
| 1.200000000000053 | 0 | 0 | 0 |
| 1.203000000000053 | 0 | 0 | 0 |
| 1.206000000000053 | 0 | 0 | 0 |
| 1.209000000000053 | 0 | 0 | 0 |
| 1.212000000000053 | 0 | 0 | 0 |
| 1.215000000000052 | 0 | 0 | 0 |
| 1.218000000000052 | 0 | 0 | 0 |
| 1.221000000000052 | 0 | 0 | 0 |
| 1.224000000000052 | 0 | 0 | 0 |
| 1.227000000000052 | 0 | 0 | 0 |
| 1.230000000000052 | 0 | 0 | 0 |
| 1.233000000000052 | 0 | 0 | 0 |
| 1.236000000000052 | 0 | 0 | 0 |
| 1.239000000000052 | 0 | 0 | 0 |
| 1.242000000000051 | 0 | 0 | 0 |
| 1.245000000000051 | 0 | 0 | 0 |
| 1.248000000000051 | 0 | 0 | 0 |
| 1.251000000000051 | 0 | 0 | 0 |
| 1.254000000000051 | 0 | 0 | 0 |
| 1.257000000000051 | 0 | 0 | 0 |
| 1.260000000000051 | 0 | 0 | 0 |
| 1.263000000000051 | 0 | 0 | 0 |
| 1.266000000000051 | 0 | 0 | 0 |
| 1.269000000000051 | 0 | 0 | 0 |
| 1.27200000000005 | 0 | 0 | 0 |
| 1.27500000000005 | 0 | 0 | 0 |
| 1.27800000000005 | 0 | 0 | 0 |
| 1.28100000000005 | 0 | 0 | 0 |
| 1.28400000000005 | 0 | 0 | 0 |
| 1.28700000000005 | 0 | 0 | 0 |
| 1.29000000000005 | 0 | 0 | 0 |
| 1.29300000000005 | 0 | 0 | 0 |
| 1.29600000000005 | 0 | 0 | 0 |
| 1.299000000000049 | 0 | 0 | 0 |
| 1.302000000000049 | 0 | 0 | 0 |
| 1.305000000000049 | 0 | 0 | 0 |
| 1.30800000000005 | 0 | 0 | 0 |
| 1.311000000000049 | 0 | 0 | 0 |
| 1.314000000000049 | 0 | 0 | 0 |
| 1.317000000000049 | 0 | 0 | 0 |
| 1.320000000000049 | 0 | 0 | 0 |
| 1.323000000000049 | 0 | 0 | 0 |
| 1.326000000000048 | 0 | 0 | 0 |
| 1.329000000000048 | 0 | 0 | 0 |
| 1.332000000000048 | 0 | 0 | 0 |
| 1.335000000000048 | 0 | 0 | 0 |
| 1.338000000000048 | 0 | 0 | 0 |
| 1.341000000000048 | 0 | 0 | 0 |
| 1.344000000000048 | 0 | 0 | 0 |
| 1.347000000000048 | 0 | 0 | 0 |
| 1.350000000000048 | 0 | 0 | 0 |
| 1.353000000000047 | 0 | 0 | 0 |
| 1.356000000000047 | 0 | 0 | 0 |
| 1.359000000000047 | 0 | 0 | 0 |
| 1.362000000000047 | 0 | 0 | 0 |
| 1.365000000000047 | 0 | 0 | 0 |
| 1.368000000000047 | 0 | 0 | 0 |
| 1.371000000000047 | 0 | 0 | 0 |
| 1.374000000000047 | 0 | 0 | 0 |
| 1.377000000000047 | 0 | 0 | 0 |
| 1.380000000000046 | 0 | 0 | 0 |
| 1.383000000000046 | 0 | 0 | 0 |
| 1.386000000000046 | 0 | 0 | 0 |
| 1.389000000000046 | 0 | 0 | 0 |
| 1.392000000000046 | 0 | 0 | 0 |
| 1.395000000000046 | 0 | 0 | 0 |
| 1.398000000000046 | 0 | 0 | 0 |
| 1.401000000000046 | 0 | 0 | 0 |
| 1.404000000000046 | 0 | 0 | 0 |
| 1.407000000000046 | 0 | 0 | 0 |
| 1.410000000000045 | 0 | 0 | 0 |
| 1.413000000000045 | 0 | 0 | 0 |
| 1.416000000000045 | 0 | 0 | 0 |
| 1.419000000000045 | 0 | 0 | 0 |
| 1.422000000000045 | 0 | 0 | 0 |
| 1.425000000000045 | 0 | 0 | 0 |
| 1.428000000000045 | 0 | 0 | 0 |
| 1.431000000000045 | 0 | 0 | 0 |
| 1.434000000000045 | 0 | 0 | 0 |
| 1.437000000000044 | 0 | 0 | 0 |
| 1.440000000000044 | 0 | 0 | 0 |
| 1.443000000000044 | 0 | 0 | 0 |
| 1.446000000000044 | 0 | 0 | 0 |
| 1.449000000000044 | 0 | 0 | 0 |
| 1.452000000000044 | 0 | 0 | 0 |
| 1.455000000000044 | 0 | 0 | 0 |
| 1.458000000000044 | 0 | 0 | 0 |
| 1.461000000000044 | 0 | 0 | 0 |
| 1.464000000000043 | 0 | 0 | 0 |
| 1.467000000000043 | 0 | 0 | 0 |
| 1.470000000000043 | 0 | 0 | 0 |
| 1.473000000000043 | 0 | 0 | 0 |
| 1.476000000000043 | 0 | 0 | 0 |
| 1.479000000000043 | 0 | 0 | 0 |
| 1.482000000000043 | 0 | 0 | 0 |
| 1.485000000000043 | 0 | 0 | 0 |
| 1.488000000000043 | 0 | 0 | 0 |
| 1.491000000000042 | 0 | 0 | 0 |
| 1.494000000000042 | 0 | 0 | 0 |
| 1.497000000000042 | 0 | 0 | 0 |
| 1.500000000000042 | 0 | 0 | 0 |